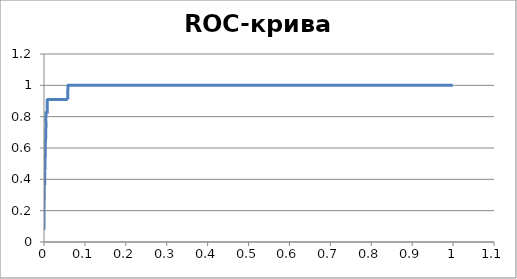
| Category | Чувствительность |
|---|---|
| 0.0 | 0.091 |
| 0.0 | 0.091 |
| 0.0 | 0.182 |
| 0.0003543586109142627 | 0.273 |
| 0.0003543586109142627 | 0.273 |
| 0.0003543586109142627 | 0.364 |
| 0.0007087172218285254 | 0.364 |
| 0.0007087172218285254 | 0.364 |
| 0.001063075832742788 | 0.364 |
| 0.0014174344436569397 | 0.364 |
| 0.0017717930545712024 | 0.364 |
| 0.002126151665485465 | 0.455 |
| 0.0024805102763997278 | 0.545 |
| 0.0024805102763997278 | 0.545 |
| 0.0024805102763997278 | 0.545 |
| 0.0028348688873139904 | 0.545 |
| 0.003189227498228253 | 0.636 |
| 0.003543586109142405 | 0.636 |
| 0.003543586109142405 | 0.636 |
| 0.0038979447200566675 | 0.636 |
| 0.00425230333097093 | 0.727 |
| 0.004606661941885193 | 0.727 |
| 0.004606661941885193 | 0.818 |
| 0.0049610205527994555 | 0.818 |
| 0.0049610205527994555 | 0.818 |
| 0.005315379163713718 | 0.818 |
| 0.00566973777462787 | 0.818 |
| 0.0060240963855421326 | 0.818 |
| 0.006378454996456395 | 0.818 |
| 0.006732813607370658 | 0.818 |
| 0.007087172218284921 | 0.818 |
| 0.007441530829199183 | 0.818 |
| 0.007795889440113446 | 0.818 |
| 0.008150248051027598 | 0.909 |
| 0.00850460666194186 | 0.909 |
| 0.00850460666194186 | 0.909 |
| 0.008858965272856123 | 0.909 |
| 0.009213323883770386 | 0.909 |
| 0.009567682494684648 | 0.909 |
| 0.009922041105598911 | 0.909 |
| 0.010276399716513063 | 0.909 |
| 0.010630758327427325 | 0.909 |
| 0.010985116938341588 | 0.909 |
| 0.01133947554925585 | 0.909 |
| 0.011693834160170113 | 0.909 |
| 0.012048192771084376 | 0.909 |
| 0.012402551381998528 | 0.909 |
| 0.01275690999291279 | 0.909 |
| 0.013111268603827053 | 0.909 |
| 0.013465627214741316 | 0.909 |
| 0.013819985825655579 | 0.909 |
| 0.014174344436569841 | 0.909 |
| 0.014528703047484104 | 0.909 |
| 0.014883061658398256 | 0.909 |
| 0.015237420269312518 | 0.909 |
| 0.015591778880226781 | 0.909 |
| 0.015946137491141044 | 0.909 |
| 0.016300496102055306 | 0.909 |
| 0.01665485471296957 | 0.909 |
| 0.01700921332388372 | 0.909 |
| 0.017363571934797983 | 0.909 |
| 0.017717930545712246 | 0.909 |
| 0.01807228915662651 | 0.909 |
| 0.01842664776754077 | 0.909 |
| 0.018781006378455034 | 0.909 |
| 0.019135364989369297 | 0.909 |
| 0.01948972360028345 | 0.909 |
| 0.01984408221119771 | 0.909 |
| 0.020198440822111974 | 0.909 |
| 0.020552799433026236 | 0.909 |
| 0.0209071580439405 | 0.909 |
| 0.021261516654854762 | 0.909 |
| 0.021615875265768913 | 0.909 |
| 0.021970233876683176 | 0.909 |
| 0.02232459248759744 | 0.909 |
| 0.0226789510985117 | 0.909 |
| 0.023033309709425964 | 0.909 |
| 0.023387668320340227 | 0.909 |
| 0.02374202693125438 | 0.909 |
| 0.02409638554216864 | 0.909 |
| 0.024450744153082904 | 0.909 |
| 0.024805102763997167 | 0.909 |
| 0.02515946137491143 | 0.909 |
| 0.025513819985825692 | 0.909 |
| 0.025868178596739955 | 0.909 |
| 0.026222537207654106 | 0.909 |
| 0.02657689581856837 | 0.909 |
| 0.02693125442948263 | 0.909 |
| 0.027285613040396894 | 0.909 |
| 0.027639971651311157 | 0.909 |
| 0.02799433026222542 | 0.909 |
| 0.02834868887313957 | 0.909 |
| 0.028703047484053834 | 0.909 |
| 0.029057406094968097 | 0.909 |
| 0.02941176470588236 | 0.909 |
| 0.029766123316796622 | 0.909 |
| 0.030120481927710885 | 0.909 |
| 0.030474840538625037 | 0.909 |
| 0.0308291991495393 | 0.909 |
| 0.031183557760453562 | 0.909 |
| 0.031537916371367825 | 0.909 |
| 0.03189227498228209 | 0.909 |
| 0.03224663359319635 | 0.909 |
| 0.03260099220411061 | 0.909 |
| 0.032955350815024764 | 0.909 |
| 0.03330970942593903 | 0.909 |
| 0.03366406803685329 | 0.909 |
| 0.03401842664776755 | 0.909 |
| 0.034372785258681815 | 0.909 |
| 0.03472714386959608 | 0.909 |
| 0.03508150248051023 | 0.909 |
| 0.03543586109142449 | 0.909 |
| 0.035790219702338755 | 0.909 |
| 0.03614457831325302 | 0.909 |
| 0.03649893692416728 | 0.909 |
| 0.03685329553508154 | 0.909 |
| 0.037207654145995694 | 0.909 |
| 0.03756201275690996 | 0.909 |
| 0.03791637136782422 | 0.909 |
| 0.03827072997873848 | 0.909 |
| 0.038625088589652745 | 0.909 |
| 0.03897944720056701 | 0.909 |
| 0.03933380581148127 | 0.909 |
| 0.03968816442239542 | 0.909 |
| 0.040042523033309685 | 0.909 |
| 0.04039688164422395 | 0.909 |
| 0.04075124025513821 | 0.909 |
| 0.04110559886605247 | 0.909 |
| 0.041459957476966736 | 0.909 |
| 0.04181431608788089 | 0.909 |
| 0.04216867469879515 | 0.909 |
| 0.04252303330970941 | 0.909 |
| 0.042877391920623675 | 0.909 |
| 0.04323175053153794 | 0.909 |
| 0.0435861091424522 | 0.909 |
| 0.04394046775336635 | 0.909 |
| 0.044294826364280615 | 0.909 |
| 0.04464918497519488 | 0.909 |
| 0.04500354358610914 | 0.909 |
| 0.0453579021970234 | 0.909 |
| 0.045712260807937666 | 0.909 |
| 0.04606661941885193 | 0.909 |
| 0.04642097802976608 | 0.909 |
| 0.04677533664068034 | 0.909 |
| 0.047129695251594605 | 0.909 |
| 0.04748405386250887 | 0.909 |
| 0.04783841247342313 | 0.909 |
| 0.048192771084337394 | 0.909 |
| 0.048547129695251545 | 0.909 |
| 0.04890148830616581 | 0.909 |
| 0.04925584691708007 | 0.909 |
| 0.04961020552799433 | 0.909 |
| 0.049964564138908596 | 0.909 |
| 0.05031892274982286 | 0.909 |
| 0.05067328136073712 | 0.909 |
| 0.05102763997165127 | 0.909 |
| 0.051381998582565536 | 0.909 |
| 0.0517363571934798 | 0.909 |
| 0.05209071580439406 | 0.909 |
| 0.052445074415308324 | 0.909 |
| 0.052799433026222586 | 0.909 |
| 0.05315379163713674 | 0.909 |
| 0.053508150248051 | 0.909 |
| 0.05386250885896526 | 0.909 |
| 0.054216867469879526 | 0.909 |
| 0.05457122608079379 | 0.909 |
| 0.05492558469170805 | 0.909 |
| 0.0552799433026222 | 0.909 |
| 0.055634301913536466 | 0.909 |
| 0.05598866052445073 | 0.909 |
| 0.05634301913536499 | 0.909 |
| 0.056697377746279254 | 0.909 |
| 0.05705173635719352 | 0.909 |
| 0.05740609496810778 | 0.909 |
| 0.05776045357902193 | 0.909 |
| 0.058114812189936194 | 0.909 |
| 0.058469170800850456 | 1 |
| 0.05882352941176472 | 1 |
| 0.05882352941176472 | 1 |
| 0.05917788802267898 | 1 |
| 0.059532246633593244 | 1 |
| 0.059886605244507396 | 1 |
| 0.06024096385542166 | 1 |
| 0.06059532246633592 | 1 |
| 0.060949681077250184 | 1 |
| 0.06130403968816445 | 1 |
| 0.06165839829907871 | 1 |
| 0.06201275690999286 | 1 |
| 0.062367115520907124 | 1 |
| 0.06272147413182139 | 1 |
| 0.06307583274273565 | 1 |
| 0.06343019135364991 | 1 |
| 0.06378454996456417 | 1 |
| 0.06413890857547844 | 1 |
| 0.06449326718639259 | 1 |
| 0.06484762579730685 | 1 |
| 0.06520198440822111 | 1 |
| 0.06555634301913538 | 1 |
| 0.06591070163004964 | 1 |
| 0.0662650602409639 | 1 |
| 0.06661941885187805 | 1 |
| 0.06697377746279232 | 1 |
| 0.06732813607370658 | 1 |
| 0.06768249468462084 | 1 |
| 0.0680368532955351 | 1 |
| 0.06839121190644937 | 1 |
| 0.06874557051736352 | 1 |
| 0.06909992912827778 | 1 |
| 0.06945428773919204 | 1 |
| 0.06980864635010631 | 1 |
| 0.07016300496102057 | 1 |
| 0.07051736357193483 | 1 |
| 0.0708717221828491 | 1 |
| 0.07122608079376325 | 1 |
| 0.07158043940467751 | 1 |
| 0.07193479801559177 | 1 |
| 0.07228915662650603 | 1 |
| 0.0726435152374203 | 1 |
| 0.07299787384833456 | 1 |
| 0.07335223245924871 | 1 |
| 0.07370659107016297 | 1 |
| 0.07406094968107724 | 1 |
| 0.0744153082919915 | 1 |
| 0.07476966690290576 | 1 |
| 0.07512402551382003 | 1 |
| 0.07547838412473418 | 1 |
| 0.07583274273564844 | 1 |
| 0.0761871013465627 | 1 |
| 0.07654145995747696 | 1 |
| 0.07689581856839123 | 1 |
| 0.07725017717930549 | 1 |
| 0.07760453579021975 | 1 |
| 0.0779588944011339 | 1 |
| 0.07831325301204817 | 1 |
| 0.07866761162296243 | 1 |
| 0.07902197023387669 | 1 |
| 0.07937632884479096 | 1 |
| 0.07973068745570522 | 1 |
| 0.08008504606661937 | 1 |
| 0.08043940467753363 | 1 |
| 0.0807937632884479 | 1 |
| 0.08114812189936216 | 1 |
| 0.08150248051027642 | 1 |
| 0.08185683912119068 | 1 |
| 0.08221119773210483 | 1 |
| 0.0825655563430191 | 1 |
| 0.08291991495393336 | 1 |
| 0.08327427356484762 | 1 |
| 0.08362863217576189 | 1 |
| 0.08398299078667615 | 1 |
| 0.08433734939759041 | 1 |
| 0.08469170800850456 | 1 |
| 0.08504606661941883 | 1 |
| 0.08540042523033309 | 1 |
| 0.08575478384124735 | 1 |
| 0.08610914245216161 | 1 |
| 0.08646350106307588 | 1 |
| 0.08681785967399003 | 1 |
| 0.08717221828490429 | 1 |
| 0.08752657689581855 | 1 |
| 0.08788093550673282 | 1 |
| 0.08823529411764708 | 1 |
| 0.08858965272856134 | 1 |
| 0.0889440113394756 | 1 |
| 0.08929836995038976 | 1 |
| 0.08965272856130402 | 1 |
| 0.09000708717221828 | 1 |
| 0.09036144578313254 | 1 |
| 0.0907158043940468 | 1 |
| 0.09107016300496107 | 1 |
| 0.09142452161587522 | 1 |
| 0.09177888022678948 | 1 |
| 0.09213323883770375 | 1 |
| 0.09248759744861801 | 1 |
| 0.09284195605953227 | 1 |
| 0.09319631467044653 | 1 |
| 0.09355067328136069 | 1 |
| 0.09390503189227495 | 1 |
| 0.09425939050318921 | 1 |
| 0.09461374911410347 | 1 |
| 0.09496810772501774 | 1 |
| 0.095322466335932 | 1 |
| 0.09567682494684626 | 1 |
| 0.09603118355776041 | 1 |
| 0.09638554216867468 | 1 |
| 0.09673990077958894 | 1 |
| 0.0970942593905032 | 1 |
| 0.09744861800141746 | 1 |
| 0.09780297661233173 | 1 |
| 0.09815733522324588 | 1 |
| 0.09851169383416014 | 1 |
| 0.0988660524450744 | 1 |
| 0.09922041105598867 | 1 |
| 0.09957476966690293 | 1 |
| 0.09992912827781719 | 1 |
| 0.10028348688873134 | 1 |
| 0.1006378454996456 | 1 |
| 0.10099220411055987 | 1 |
| 0.10134656272147413 | 1 |
| 0.1017009213323884 | 1 |
| 0.10205527994330266 | 1 |
| 0.10240963855421692 | 1 |
| 0.10276399716513107 | 1 |
| 0.10311835577604533 | 1 |
| 0.1034727143869596 | 1 |
| 0.10382707299787386 | 1 |
| 0.10418143160878812 | 1 |
| 0.10453579021970238 | 1 |
| 0.10489014883061654 | 1 |
| 0.1052445074415308 | 1 |
| 0.10559886605244506 | 1 |
| 0.10595322466335932 | 1 |
| 0.10630758327427359 | 1 |
| 0.10666194188518785 | 1 |
| 0.107016300496102 | 1 |
| 0.10737065910701626 | 1 |
| 0.10772501771793053 | 1 |
| 0.10807937632884479 | 1 |
| 0.10843373493975905 | 1 |
| 0.10878809355067331 | 1 |
| 0.10914245216158758 | 1 |
| 0.10949681077250173 | 1 |
| 0.10985116938341599 | 1 |
| 0.11020552799433025 | 1 |
| 0.11055988660524452 | 1 |
| 0.11091424521615878 | 1 |
| 0.11126860382707304 | 1 |
| 0.1116229624379872 | 1 |
| 0.11197732104890146 | 1 |
| 0.11233167965981572 | 1 |
| 0.11268603827072998 | 1 |
| 0.11304039688164425 | 1 |
| 0.11339475549255851 | 1 |
| 0.11374911410347266 | 1 |
| 0.11410347271438692 | 1 |
| 0.11445783132530118 | 1 |
| 0.11481218993621545 | 1 |
| 0.11516654854712971 | 1 |
| 0.11552090715804397 | 1 |
| 0.11587526576895824 | 1 |
| 0.11622962437987239 | 1 |
| 0.11658398299078665 | 1 |
| 0.11693834160170091 | 1 |
| 0.11729270021261518 | 1 |
| 0.11764705882352944 | 1 |
| 0.1180014174344437 | 1 |
| 0.11835577604535785 | 1 |
| 0.11871013465627211 | 1 |
| 0.11906449326718638 | 1 |
| 0.11941885187810064 | 1 |
| 0.1197732104890149 | 1 |
| 0.12012756909992917 | 1 |
| 0.12048192771084343 | 1 |
| 0.12083628632175758 | 1 |
| 0.12119064493267184 | 1 |
| 0.1215450035435861 | 1 |
| 0.12189936215450037 | 1 |
| 0.12225372076541463 | 1 |
| 0.1226080793763289 | 1 |
| 0.12296243798724305 | 1 |
| 0.12331679659815731 | 1 |
| 0.12367115520907157 | 1 |
| 0.12402551381998583 | 1 |
| 0.1243798724309001 | 1 |
| 0.12473423104181436 | 1 |
| 0.1250885896527285 | 1 |
| 0.12544294826364277 | 1 |
| 0.12579730687455704 | 1 |
| 0.1261516654854713 | 1 |
| 0.12650602409638556 | 1 |
| 0.12686038270729982 | 1 |
| 0.1272147413182141 | 1 |
| 0.12756909992912824 | 1 |
| 0.1279234585400425 | 1 |
| 0.12827781715095676 | 1 |
| 0.12863217576187103 | 1 |
| 0.1289865343727853 | 1 |
| 0.12934089298369955 | 1 |
| 0.1296952515946137 | 1 |
| 0.13004961020552797 | 1 |
| 0.13040396881644223 | 1 |
| 0.1307583274273565 | 1 |
| 0.13111268603827075 | 1 |
| 0.13146704464918502 | 1 |
| 0.13182140326009917 | 1 |
| 0.13217576187101343 | 1 |
| 0.1325301204819277 | 1 |
| 0.13288447909284196 | 1 |
| 0.13323883770375622 | 1 |
| 0.13359319631467048 | 1 |
| 0.13394755492558474 | 1 |
| 0.1343019135364989 | 1 |
| 0.13465627214741316 | 1 |
| 0.13501063075832742 | 1 |
| 0.13536498936924168 | 1 |
| 0.13571934798015595 | 1 |
| 0.1360737065910702 | 1 |
| 0.13642806520198436 | 1 |
| 0.13678242381289862 | 1 |
| 0.1371367824238129 | 1 |
| 0.13749114103472715 | 1 |
| 0.1378454996456414 | 1 |
| 0.13819985825655567 | 1 |
| 0.13855421686746983 | 1 |
| 0.1389085754783841 | 1 |
| 0.13926293408929835 | 1 |
| 0.13961729270021261 | 1 |
| 0.13997165131112688 | 1 |
| 0.14032600992204114 | 1 |
| 0.1406803685329554 | 1 |
| 0.14103472714386955 | 1 |
| 0.14138908575478382 | 1 |
| 0.14174344436569808 | 1 |
| 0.14209780297661234 | 1 |
| 0.1424521615875266 | 1 |
| 0.14280652019844087 | 1 |
| 0.14316087880935502 | 1 |
| 0.14351523742026928 | 1 |
| 0.14386959603118354 | 1 |
| 0.1442239546420978 | 1 |
| 0.14457831325301207 | 1 |
| 0.14493267186392633 | 1 |
| 0.14528703047484048 | 1 |
| 0.14564138908575475 | 1 |
| 0.145995747696669 | 1 |
| 0.14635010630758327 | 1 |
| 0.14670446491849753 | 1 |
| 0.1470588235294118 | 1 |
| 0.14741318214032606 | 1 |
| 0.1477675407512402 | 1 |
| 0.14812189936215447 | 1 |
| 0.14847625797306874 | 1 |
| 0.148830616583983 | 1 |
| 0.14918497519489726 | 1 |
| 0.14953933380581153 | 1 |
| 0.14989369241672568 | 1 |
| 0.15024805102763994 | 1 |
| 0.1506024096385542 | 1 |
| 0.15095676824946846 | 1 |
| 0.15131112686038273 | 1 |
| 0.151665485471297 | 1 |
| 0.15201984408221125 | 1 |
| 0.1523742026931254 | 1 |
| 0.15272856130403967 | 1 |
| 0.15308291991495393 | 1 |
| 0.1534372785258682 | 1 |
| 0.15379163713678246 | 1 |
| 0.15414599574769672 | 1 |
| 0.15450035435861087 | 1 |
| 0.15485471296952513 | 1 |
| 0.1552090715804394 | 1 |
| 0.15556343019135366 | 1 |
| 0.15591778880226792 | 1 |
| 0.15627214741318218 | 1 |
| 0.15662650602409633 | 1 |
| 0.1569808646350106 | 1 |
| 0.15733522324592486 | 1 |
| 0.15768958185683912 | 1 |
| 0.15804394046775339 | 1 |
| 0.15839829907866765 | 1 |
| 0.1587526576895819 | 1 |
| 0.15910701630049606 | 1 |
| 0.15946137491141033 | 1 |
| 0.1598157335223246 | 1 |
| 0.16017009213323885 | 1 |
| 0.1605244507441531 | 1 |
| 0.16087880935506738 | 1 |
| 0.16123316796598153 | 1 |
| 0.1615875265768958 | 1 |
| 0.16194188518781005 | 1 |
| 0.16229624379872432 | 1 |
| 0.16265060240963858 | 1 |
| 0.16300496102055284 | 1 |
| 0.163359319631467 | 1 |
| 0.16371367824238126 | 1 |
| 0.16406803685329552 | 1 |
| 0.16442239546420978 | 1 |
| 0.16477675407512404 | 1 |
| 0.1651311126860383 | 1 |
| 0.16548547129695257 | 1 |
| 0.16583982990786672 | 1 |
| 0.16619418851878098 | 1 |
| 0.16654854712969525 | 1 |
| 0.1669029057406095 | 1 |
| 0.16725726435152377 | 1 |
| 0.16761162296243803 | 1 |
| 0.16796598157335219 | 1 |
| 0.16832034018426645 | 1 |
| 0.1686746987951807 | 1 |
| 0.16902905740609497 | 1 |
| 0.16938341601700924 | 1 |
| 0.1697377746279235 | 1 |
| 0.17009213323883765 | 1 |
| 0.1704464918497519 | 1 |
| 0.17080085046066618 | 1 |
| 0.17115520907158044 | 1 |
| 0.1715095676824947 | 1 |
| 0.17186392629340896 | 1 |
| 0.17221828490432323 | 1 |
| 0.17257264351523738 | 1 |
| 0.17292700212615164 | 1 |
| 0.1732813607370659 | 1 |
| 0.17363571934798017 | 1 |
| 0.17399007795889443 | 1 |
| 0.1743444365698087 | 1 |
| 0.17469879518072284 | 1 |
| 0.1750531537916371 | 1 |
| 0.17540751240255137 | 1 |
| 0.17576187101346563 | 1 |
| 0.1761162296243799 | 1 |
| 0.17647058823529416 | 1 |
| 0.1768249468462083 | 1 |
| 0.17717930545712257 | 1 |
| 0.17753366406803683 | 1 |
| 0.1778880226789511 | 1 |
| 0.17824238128986536 | 1 |
| 0.17859673990077962 | 1 |
| 0.17895109851169388 | 1 |
| 0.17930545712260804 | 1 |
| 0.1796598157335223 | 1 |
| 0.18001417434443656 | 1 |
| 0.18036853295535082 | 1 |
| 0.1807228915662651 | 1 |
| 0.18107725017717935 | 1 |
| 0.1814316087880935 | 1 |
| 0.18178596739900776 | 1 |
| 0.18214032600992203 | 1 |
| 0.1824946846208363 | 1 |
| 0.18284904323175055 | 1 |
| 0.18320340184266481 | 1 |
| 0.18355776045357908 | 1 |
| 0.18391211906449323 | 1 |
| 0.1842664776754075 | 1 |
| 0.18462083628632175 | 1 |
| 0.18497519489723602 | 1 |
| 0.18532955350815028 | 1 |
| 0.18568391211906454 | 1 |
| 0.1860382707299787 | 1 |
| 0.18639262934089296 | 1 |
| 0.18674698795180722 | 1 |
| 0.18710134656272148 | 1 |
| 0.18745570517363574 | 1 |
| 0.18781006378455 | 1 |
| 0.18816442239546416 | 1 |
| 0.18851878100637842 | 1 |
| 0.18887313961729268 | 1 |
| 0.18922749822820695 | 1 |
| 0.1895818568391212 | 1 |
| 0.18993621545003547 | 1 |
| 0.19029057406094974 | 1 |
| 0.1906449326718639 | 1 |
| 0.19099929128277815 | 1 |
| 0.1913536498936924 | 1 |
| 0.19170800850460668 | 1 |
| 0.19206236711552094 | 1 |
| 0.1924167257264352 | 1 |
| 0.19277108433734935 | 1 |
| 0.19312544294826361 | 1 |
| 0.19347980155917788 | 1 |
| 0.19383416017009214 | 1 |
| 0.1941885187810064 | 1 |
| 0.19454287739192067 | 1 |
| 0.19489723600283482 | 1 |
| 0.19525159461374908 | 1 |
| 0.19560595322466334 | 1 |
| 0.1959603118355776 | 1 |
| 0.19631467044649187 | 1 |
| 0.19666902905740613 | 1 |
| 0.1970233876683204 | 1 |
| 0.19737774627923454 | 1 |
| 0.1977321048901488 | 1 |
| 0.19808646350106307 | 1 |
| 0.19844082211197733 | 1 |
| 0.1987951807228916 | 1 |
| 0.19914953933380586 | 1 |
| 0.19950389794472 | 1 |
| 0.19985825655563427 | 1 |
| 0.20021261516654854 | 1 |
| 0.2005669737774628 | 1 |
| 0.20092133238837706 | 1 |
| 0.20127569099929132 | 1 |
| 0.20163004961020548 | 1 |
| 0.20198440822111974 | 1 |
| 0.202338766832034 | 1 |
| 0.20269312544294826 | 1 |
| 0.20304748405386253 | 1 |
| 0.2034018426647768 | 1 |
| 0.20375620127569105 | 1 |
| 0.2041105598866052 | 1 |
| 0.20446491849751947 | 1 |
| 0.20481927710843373 | 1 |
| 0.205173635719348 | 1 |
| 0.20552799433026225 | 1 |
| 0.20588235294117652 | 1 |
| 0.20623671155209067 | 1 |
| 0.20659107016300493 | 1 |
| 0.2069454287739192 | 1 |
| 0.20729978738483346 | 1 |
| 0.20765414599574772 | 1 |
| 0.20800850460666198 | 1 |
| 0.20836286321757613 | 1 |
| 0.2087172218284904 | 1 |
| 0.20907158043940466 | 1 |
| 0.20942593905031892 | 1 |
| 0.20978029766123318 | 1 |
| 0.21013465627214745 | 1 |
| 0.2104890148830617 | 1 |
| 0.21084337349397586 | 1 |
| 0.21119773210489012 | 1 |
| 0.2115520907158044 | 1 |
| 0.21190644932671865 | 1 |
| 0.2122608079376329 | 1 |
| 0.21261516654854717 | 1 |
| 0.21296952515946133 | 1 |
| 0.2133238837703756 | 1 |
| 0.21367824238128985 | 1 |
| 0.21403260099220411 | 1 |
| 0.21438695960311838 | 1 |
| 0.21474131821403264 | 1 |
| 0.2150956768249468 | 1 |
| 0.21545003543586105 | 1 |
| 0.21580439404677532 | 1 |
| 0.21615875265768958 | 1 |
| 0.21651311126860384 | 1 |
| 0.2168674698795181 | 1 |
| 0.21722182849043237 | 1 |
| 0.21757618710134652 | 1 |
| 0.21793054571226078 | 1 |
| 0.21828490432317504 | 1 |
| 0.2186392629340893 | 1 |
| 0.21899362154500357 | 1 |
| 0.21934798015591783 | 1 |
| 0.21970233876683198 | 1 |
| 0.22005669737774625 | 1 |
| 0.2204110559886605 | 1 |
| 0.22076541459957477 | 1 |
| 0.22111977321048903 | 1 |
| 0.2214741318214033 | 1 |
| 0.22182849043231756 | 1 |
| 0.2221828490432317 | 1 |
| 0.22253720765414597 | 1 |
| 0.22289156626506024 | 1 |
| 0.2232459248759745 | 1 |
| 0.22360028348688876 | 1 |
| 0.22395464209780303 | 1 |
| 0.22430900070871718 | 1 |
| 0.22466335931963144 | 1 |
| 0.2250177179305457 | 1 |
| 0.22537207654145996 | 1 |
| 0.22572643515237423 | 1 |
| 0.2260807937632885 | 1 |
| 0.22643515237420264 | 1 |
| 0.2267895109851169 | 1 |
| 0.22714386959603117 | 1 |
| 0.22749822820694543 | 1 |
| 0.2278525868178597 | 1 |
| 0.22820694542877396 | 1 |
| 0.22856130403968822 | 1 |
| 0.22891566265060237 | 1 |
| 0.22927002126151663 | 1 |
| 0.2296243798724309 | 1 |
| 0.22997873848334516 | 1 |
| 0.23033309709425942 | 1 |
| 0.23068745570517368 | 1 |
| 0.23104181431608783 | 1 |
| 0.2313961729270021 | 1 |
| 0.23175053153791636 | 1 |
| 0.23210489014883062 | 1 |
| 0.23245924875974489 | 1 |
| 0.23281360737065915 | 1 |
| 0.2331679659815733 | 1 |
| 0.23352232459248756 | 1 |
| 0.23387668320340183 | 1 |
| 0.2342310418143161 | 1 |
| 0.23458540042523035 | 1 |
| 0.2349397590361446 | 1 |
| 0.23529411764705888 | 1 |
| 0.23564847625797303 | 1 |
| 0.2360028348688873 | 1 |
| 0.23635719347980155 | 1 |
| 0.23671155209071582 | 1 |
| 0.23706591070163008 | 1 |
| 0.23742026931254434 | 1 |
| 0.2377746279234585 | 1 |
| 0.23812898653437276 | 1 |
| 0.23848334514528702 | 1 |
| 0.23883770375620128 | 1 |
| 0.23919206236711554 | 1 |
| 0.2395464209780298 | 1 |
| 0.23990077958894396 | 1 |
| 0.24025513819985822 | 1 |
| 0.24060949681077248 | 1 |
| 0.24096385542168675 | 1 |
| 0.241318214032601 | 1 |
| 0.24167257264351527 | 1 |
| 0.24202693125442953 | 1 |
| 0.24238128986534369 | 1 |
| 0.24273564847625795 | 1 |
| 0.2430900070871722 | 1 |
| 0.24344436569808647 | 1 |
| 0.24379872430900074 | 1 |
| 0.244153082919915 | 1 |
| 0.24450744153082915 | 1 |
| 0.2448618001417434 | 1 |
| 0.24521615875265768 | 1 |
| 0.24557051736357194 | 1 |
| 0.2459248759744862 | 1 |
| 0.24627923458540046 | 1 |
| 0.24663359319631462 | 1 |
| 0.24698795180722888 | 1 |
| 0.24734231041814314 | 1 |
| 0.2476966690290574 | 1 |
| 0.24805102763997167 | 1 |
| 0.24840538625088593 | 1 |
| 0.2487597448618002 | 1 |
| 0.24911410347271434 | 1 |
| 0.2494684620836286 | 1 |
| 0.24982282069454287 | 1 |
| 0.25017717930545713 | 1 |
| 0.2505315379163714 | 1 |
| 0.25088589652728566 | 1 |
| 0.2512402551381998 | 1 |
| 0.25159461374911407 | 1 |
| 0.25194897236002833 | 1 |
| 0.2523033309709426 | 1 |
| 0.25265768958185686 | 1 |
| 0.2530120481927711 | 1 |
| 0.2533664068036854 | 1 |
| 0.25372076541459954 | 1 |
| 0.2540751240255138 | 1 |
| 0.25442948263642806 | 1 |
| 0.2547838412473423 | 1 |
| 0.2551381998582566 | 1 |
| 0.25549255846917085 | 1 |
| 0.255846917080085 | 1 |
| 0.25620127569099926 | 1 |
| 0.2565556343019135 | 1 |
| 0.2569099929128278 | 1 |
| 0.25726435152374205 | 1 |
| 0.2576187101346563 | 1 |
| 0.25797306874557047 | 1 |
| 0.25832742735648473 | 1 |
| 0.258681785967399 | 1 |
| 0.25903614457831325 | 1 |
| 0.2593905031892275 | 1 |
| 0.2597448618001418 | 1 |
| 0.26009922041105604 | 1 |
| 0.2604535790219702 | 1 |
| 0.26080793763288446 | 1 |
| 0.2611622962437987 | 1 |
| 0.261516654854713 | 1 |
| 0.26187101346562724 | 1 |
| 0.2622253720765415 | 1 |
| 0.26257973068745566 | 1 |
| 0.2629340892983699 | 1 |
| 0.2632884479092842 | 1 |
| 0.26364280652019845 | 1 |
| 0.2639971651311127 | 1 |
| 0.264351523742027 | 1 |
| 0.2647058823529411 | 1 |
| 0.2650602409638554 | 1 |
| 0.26541459957476965 | 1 |
| 0.2657689581856839 | 1 |
| 0.2661233167965982 | 1 |
| 0.26647767540751244 | 1 |
| 0.2668320340184267 | 1 |
| 0.26718639262934085 | 1 |
| 0.2675407512402551 | 1 |
| 0.2678951098511694 | 1 |
| 0.26824946846208364 | 1 |
| 0.2686038270729979 | 1 |
| 0.26895818568391217 | 1 |
| 0.2693125442948263 | 1 |
| 0.2696669029057406 | 1 |
| 0.27002126151665484 | 1 |
| 0.2703756201275691 | 1 |
| 0.27072997873848337 | 1 |
| 0.27108433734939763 | 1 |
| 0.2714386959603118 | 1 |
| 0.27179305457122604 | 1 |
| 0.2721474131821403 | 1 |
| 0.27250177179305457 | 1 |
| 0.27285613040396883 | 1 |
| 0.2732104890148831 | 1 |
| 0.27356484762579736 | 1 |
| 0.2739192062367115 | 1 |
| 0.2742735648476258 | 1 |
| 0.27462792345854004 | 1 |
| 0.2749822820694543 | 1 |
| 0.27533664068036856 | 1 |
| 0.2756909992912828 | 1 |
| 0.276045357902197 | 1 |
| 0.27639971651311124 | 1 |
| 0.2767540751240255 | 1 |
| 0.27710843373493976 | 1 |
| 0.277462792345854 | 1 |
| 0.2778171509567683 | 1 |
| 0.27817150956768244 | 1 |
| 0.2785258681785967 | 1 |
| 0.27888022678951097 | 1 |
| 0.27923458540042523 | 1 |
| 0.2795889440113395 | 1 |
| 0.27994330262225375 | 1 |
| 0.280297661233168 | 1 |
| 0.28065201984408217 | 1 |
| 0.28100637845499643 | 1 |
| 0.2813607370659107 | 1 |
| 0.28171509567682496 | 1 |
| 0.2820694542877392 | 1 |
| 0.2824238128986535 | 1 |
| 0.28277817150956763 | 1 |
| 0.2831325301204819 | 1 |
| 0.28348688873139616 | 1 |
| 0.2838412473423104 | 1 |
| 0.2841956059532247 | 1 |
| 0.28454996456413895 | 1 |
| 0.2849043231750532 | 1 |
| 0.28525868178596736 | 1 |
| 0.2856130403968816 | 1 |
| 0.2859673990077959 | 1 |
| 0.28632175761871015 | 1 |
| 0.2866761162296244 | 1 |
| 0.2870304748405387 | 1 |
| 0.2873848334514528 | 1 |
| 0.2877391920623671 | 1 |
| 0.28809355067328135 | 1 |
| 0.2884479092841956 | 1 |
| 0.2888022678951099 | 1 |
| 0.28915662650602414 | 1 |
| 0.2895109851169383 | 1 |
| 0.28986534372785255 | 1 |
| 0.2902197023387668 | 1 |
| 0.2905740609496811 | 1 |
| 0.29092841956059534 | 1 |
| 0.2912827781715096 | 1 |
| 0.29163713678242387 | 1 |
| 0.291991495393338 | 1 |
| 0.2923458540042523 | 1 |
| 0.29270021261516654 | 1 |
| 0.2930545712260808 | 1 |
| 0.29340892983699507 | 1 |
| 0.29376328844790933 | 1 |
| 0.2941176470588235 | 1 |
| 0.29447200566973775 | 1 |
| 0.294826364280652 | 1 |
| 0.29518072289156627 | 1 |
| 0.29553508150248053 | 1 |
| 0.2958894401133948 | 1 |
| 0.29624379872430895 | 1 |
| 0.2965981573352232 | 1 |
| 0.2969525159461375 | 1 |
| 0.29730687455705174 | 1 |
| 0.297661233167966 | 1 |
| 0.29801559177888026 | 1 |
| 0.2983699503897945 | 1 |
| 0.2987243090007087 | 1 |
| 0.29907866761162294 | 1 |
| 0.2994330262225372 | 1 |
| 0.29978738483345146 | 1 |
| 0.3001417434443657 | 1 |
| 0.30049610205528 | 1 |
| 0.30085046066619414 | 1 |
| 0.3012048192771084 | 1 |
| 0.30155917788802267 | 1 |
| 0.30191353649893693 | 1 |
| 0.3022678951098512 | 1 |
| 0.30262225372076546 | 1 |
| 0.3029766123316796 | 1 |
| 0.30333097094259387 | 1 |
| 0.30368532955350813 | 1 |
| 0.3040396881644224 | 1 |
| 0.30439404677533666 | 1 |
| 0.3047484053862509 | 1 |
| 0.3051027639971652 | 1 |
| 0.30545712260807933 | 1 |
| 0.3058114812189936 | 1 |
| 0.30616583982990786 | 1 |
| 0.3065201984408221 | 1 |
| 0.3068745570517364 | 1 |
| 0.30722891566265065 | 1 |
| 0.3075832742735648 | 1 |
| 0.30793763288447906 | 1 |
| 0.3082919914953933 | 1 |
| 0.3086463501063076 | 1 |
| 0.30900070871722185 | 1 |
| 0.3093550673281361 | 1 |
| 0.30970942593905026 | 1 |
| 0.3100637845499645 | 1 |
| 0.3104181431608788 | 1 |
| 0.31077250177179305 | 1 |
| 0.3111268603827073 | 1 |
| 0.3114812189936216 | 1 |
| 0.31183557760453584 | 1 |
| 0.31218993621545 | 1 |
| 0.31254429482636426 | 1 |
| 0.3128986534372785 | 1 |
| 0.3132530120481928 | 1 |
| 0.31360737065910704 | 1 |
| 0.3139617292700213 | 1 |
| 0.31431608788093546 | 1 |
| 0.3146704464918497 | 1 |
| 0.315024805102764 | 1 |
| 0.31537916371367825 | 1 |
| 0.3157335223245925 | 1 |
| 0.31608788093550677 | 1 |
| 0.3164422395464209 | 1 |
| 0.3167965981573352 | 1 |
| 0.31715095676824945 | 1 |
| 0.3175053153791637 | 1 |
| 0.317859673990078 | 1 |
| 0.31821403260099224 | 1 |
| 0.3185683912119065 | 1 |
| 0.31892274982282065 | 1 |
| 0.3192771084337349 | 1 |
| 0.3196314670446492 | 1 |
| 0.31998582565556344 | 1 |
| 0.3203401842664777 | 1 |
| 0.32069454287739196 | 1 |
| 0.3210489014883061 | 1 |
| 0.3214032600992204 | 1 |
| 0.32175761871013464 | 1 |
| 0.3221119773210489 | 1 |
| 0.32246633593196317 | 1 |
| 0.32282069454287743 | 1 |
| 0.3231750531537917 | 1 |
| 0.32352941176470584 | 1 |
| 0.3238837703756201 | 1 |
| 0.32423812898653437 | 1 |
| 0.32459248759744863 | 1 |
| 0.3249468462083629 | 1 |
| 0.32530120481927716 | 1 |
| 0.3256555634301913 | 1 |
| 0.32600992204110557 | 1 |
| 0.32636428065201983 | 1 |
| 0.3267186392629341 | 1 |
| 0.32707299787384836 | 1 |
| 0.3274273564847626 | 1 |
| 0.3277817150956768 | 1 |
| 0.32813607370659104 | 1 |
| 0.3284904323175053 | 1 |
| 0.32884479092841956 | 1 |
| 0.3291991495393338 | 1 |
| 0.3295535081502481 | 1 |
| 0.32990786676116235 | 1 |
| 0.3302622253720765 | 1 |
| 0.33061658398299076 | 1 |
| 0.330970942593905 | 1 |
| 0.3313253012048193 | 1 |
| 0.33167965981573355 | 1 |
| 0.3320340184266478 | 1 |
| 0.33238837703756197 | 1 |
| 0.33274273564847623 | 1 |
| 0.3330970942593905 | 1 |
| 0.33345145287030475 | 1 |
| 0.333805811481219 | 1 |
| 0.3341601700921333 | 1 |
| 0.33451452870304743 | 1 |
| 0.3348688873139617 | 1 |
| 0.33522324592487596 | 1 |
| 0.3355776045357902 | 1 |
| 0.3359319631467045 | 1 |
| 0.33628632175761874 | 1 |
| 0.336640680368533 | 1 |
| 0.33699503897944716 | 1 |
| 0.3373493975903614 | 1 |
| 0.3377037562012757 | 1 |
| 0.33805811481218995 | 1 |
| 0.3384124734231042 | 1 |
| 0.3387668320340185 | 1 |
| 0.3391211906449326 | 1 |
| 0.3394755492558469 | 1 |
| 0.33982990786676115 | 1 |
| 0.3401842664776754 | 1 |
| 0.3405386250885897 | 1 |
| 0.34089298369950394 | 1 |
| 0.3412473423104181 | 1 |
| 0.34160170092133235 | 1 |
| 0.3419560595322466 | 1 |
| 0.3423104181431609 | 1 |
| 0.34266477675407514 | 1 |
| 0.3430191353649894 | 1 |
| 0.34337349397590367 | 1 |
| 0.3437278525868178 | 1 |
| 0.3440822111977321 | 1 |
| 0.34443656980864634 | 1 |
| 0.3447909284195606 | 1 |
| 0.34514528703047487 | 1 |
| 0.34549964564138913 | 1 |
| 0.3458540042523033 | 1 |
| 0.34620836286321754 | 1 |
| 0.3465627214741318 | 1 |
| 0.34691708008504607 | 1 |
| 0.34727143869596033 | 1 |
| 0.3476257973068746 | 1 |
| 0.34798015591778875 | 1 |
| 0.348334514528703 | 1 |
| 0.3486888731396173 | 1 |
| 0.34904323175053154 | 1 |
| 0.3493975903614458 | 1 |
| 0.34975194897236006 | 1 |
| 0.3501063075832743 | 1 |
| 0.3504606661941885 | 1 |
| 0.35081502480510274 | 1 |
| 0.351169383416017 | 1 |
| 0.35152374202693126 | 1 |
| 0.3518781006378455 | 1 |
| 0.3522324592487598 | 1 |
| 0.35258681785967394 | 1 |
| 0.3529411764705882 | 1 |
| 0.35329553508150247 | 1 |
| 0.35364989369241673 | 1 |
| 0.354004252303331 | 1 |
| 0.35435861091424525 | 1 |
| 0.3547129695251595 | 1 |
| 0.35506732813607367 | 1 |
| 0.35542168674698793 | 1 |
| 0.3557760453579022 | 1 |
| 0.35613040396881646 | 1 |
| 0.3564847625797307 | 1 |
| 0.356839121190645 | 1 |
| 0.35719347980155913 | 1 |
| 0.3575478384124734 | 1 |
| 0.35790219702338766 | 1 |
| 0.3582565556343019 | 1 |
| 0.3586109142452162 | 1 |
| 0.35896527285613045 | 1 |
| 0.3593196314670446 | 1 |
| 0.35967399007795886 | 1 |
| 0.3600283486888731 | 1 |
| 0.3603827072997874 | 1 |
| 0.36073706591070165 | 1 |
| 0.3610914245216159 | 1 |
| 0.3614457831325302 | 1 |
| 0.3618001417434443 | 1 |
| 0.3621545003543586 | 1 |
| 0.36250885896527285 | 1 |
| 0.3628632175761871 | 1 |
| 0.3632175761871014 | 1 |
| 0.36357193479801564 | 1 |
| 0.3639262934089298 | 1 |
| 0.36428065201984405 | 1 |
| 0.3646350106307583 | 1 |
| 0.3649893692416726 | 1 |
| 0.36534372785258684 | 1 |
| 0.3656980864635011 | 1 |
| 0.36605244507441526 | 1 |
| 0.3664068036853295 | 1 |
| 0.3667611622962438 | 1 |
| 0.36711552090715804 | 1 |
| 0.3674698795180723 | 1 |
| 0.36782423812898657 | 1 |
| 0.36817859673990083 | 1 |
| 0.368532955350815 | 1 |
| 0.36888731396172925 | 1 |
| 0.3692416725726435 | 1 |
| 0.36959603118355777 | 1 |
| 0.36995038979447203 | 1 |
| 0.3703047484053863 | 1 |
| 0.37065910701630045 | 1 |
| 0.3710134656272147 | 1 |
| 0.371367824238129 | 1 |
| 0.37172218284904324 | 1 |
| 0.3720765414599575 | 1 |
| 0.37243090007087176 | 1 |
| 0.3727852586817859 | 1 |
| 0.3731396172927002 | 1 |
| 0.37349397590361444 | 1 |
| 0.3738483345145287 | 1 |
| 0.37420269312544296 | 1 |
| 0.3745570517363572 | 1 |
| 0.3749114103472715 | 1 |
| 0.37526576895818564 | 1 |
| 0.3756201275690999 | 1 |
| 0.37597448618001417 | 1 |
| 0.37632884479092843 | 1 |
| 0.3766832034018427 | 1 |
| 0.37703756201275695 | 1 |
| 0.3773919206236711 | 1 |
| 0.37774627923458537 | 1 |
| 0.37810063784549963 | 1 |
| 0.3784549964564139 | 1 |
| 0.37880935506732816 | 1 |
| 0.3791637136782424 | 1 |
| 0.37951807228915657 | 1 |
| 0.37987243090007083 | 1 |
| 0.3802267895109851 | 1 |
| 0.38058114812189936 | 1 |
| 0.3809355067328136 | 1 |
| 0.3812898653437279 | 1 |
| 0.38164422395464215 | 1 |
| 0.3819985825655563 | 1 |
| 0.38235294117647056 | 1 |
| 0.3827072997873848 | 1 |
| 0.3830616583982991 | 1 |
| 0.38341601700921335 | 1 |
| 0.3837703756201276 | 1 |
| 0.38412473423104176 | 1 |
| 0.384479092841956 | 1 |
| 0.3848334514528703 | 1 |
| 0.38518781006378455 | 1 |
| 0.3855421686746988 | 1 |
| 0.3858965272856131 | 1 |
| 0.38625088589652734 | 1 |
| 0.3866052445074415 | 1 |
| 0.38695960311835575 | 1 |
| 0.38731396172927 | 1 |
| 0.3876683203401843 | 1 |
| 0.38802267895109854 | 1 |
| 0.3883770375620128 | 1 |
| 0.38873139617292696 | 1 |
| 0.3890857547838412 | 1 |
| 0.3894401133947555 | 1 |
| 0.38979447200566975 | 1 |
| 0.390148830616584 | 1 |
| 0.39050318922749827 | 1 |
| 0.3908575478384124 | 1 |
| 0.3912119064493267 | 1 |
| 0.39156626506024095 | 1 |
| 0.3919206236711552 | 1 |
| 0.3922749822820695 | 1 |
| 0.39262934089298374 | 1 |
| 0.392983699503898 | 1 |
| 0.39333805811481215 | 1 |
| 0.3936924167257264 | 1 |
| 0.3940467753366407 | 1 |
| 0.39440113394755494 | 1 |
| 0.3947554925584692 | 1 |
| 0.39510985116938346 | 1 |
| 0.3954642097802976 | 1 |
| 0.3958185683912119 | 1 |
| 0.39617292700212614 | 1 |
| 0.3965272856130404 | 1 |
| 0.39688164422395467 | 1 |
| 0.39723600283486893 | 1 |
| 0.3975903614457831 | 1 |
| 0.39794472005669734 | 1 |
| 0.3982990786676116 | 1 |
| 0.39865343727852587 | 1 |
| 0.39900779588944013 | 1 |
| 0.3993621545003544 | 1 |
| 0.39971651311126866 | 1 |
| 0.4000708717221828 | 1 |
| 0.40042523033309707 | 1 |
| 0.40077958894401133 | 1 |
| 0.4011339475549256 | 1 |
| 0.40148830616583986 | 1 |
| 0.4018426647767541 | 1 |
| 0.4021970233876683 | 1 |
| 0.40255138199858254 | 1 |
| 0.4029057406094968 | 1 |
| 0.40326009922041106 | 1 |
| 0.4036144578313253 | 1 |
| 0.4039688164422396 | 1 |
| 0.40432317505315374 | 1 |
| 0.404677533664068 | 1 |
| 0.40503189227498226 | 1 |
| 0.4053862508858965 | 1 |
| 0.4057406094968108 | 1 |
| 0.40609496810772505 | 1 |
| 0.4064493267186393 | 1 |
| 0.40680368532955347 | 1 |
| 0.40715804394046773 | 1 |
| 0.407512402551382 | 1 |
| 0.40786676116229625 | 1 |
| 0.4082211197732105 | 1 |
| 0.4085754783841248 | 1 |
| 0.40892983699503893 | 1 |
| 0.4092841956059532 | 1 |
| 0.40963855421686746 | 1 |
| 0.4099929128277817 | 1 |
| 0.410347271438696 | 1 |
| 0.41070163004961024 | 1 |
| 0.4110559886605244 | 1 |
| 0.41141034727143866 | 1 |
| 0.4117647058823529 | 1 |
| 0.4121190644932672 | 1 |
| 0.41247342310418145 | 1 |
| 0.4128277817150957 | 1 |
| 0.41318214032601 | 1 |
| 0.4135364989369241 | 1 |
| 0.4138908575478384 | 1 |
| 0.41424521615875265 | 1 |
| 0.4145995747696669 | 1 |
| 0.4149539333805812 | 1 |
| 0.41530829199149544 | 1 |
| 0.4156626506024096 | 1 |
| 0.41601700921332385 | 1 |
| 0.4163713678242381 | 1 |
| 0.4167257264351524 | 1 |
| 0.41708008504606664 | 1 |
| 0.4174344436569809 | 1 |
| 0.41778880226789517 | 1 |
| 0.4181431608788093 | 1 |
| 0.4184975194897236 | 1 |
| 0.41885187810063784 | 1 |
| 0.4192062367115521 | 1 |
| 0.41956059532246637 | 1 |
| 0.41991495393338063 | 1 |
| 0.4202693125442948 | 1 |
| 0.42062367115520904 | 1 |
| 0.4209780297661233 | 1 |
| 0.42133238837703757 | 1 |
| 0.42168674698795183 | 1 |
| 0.4220411055988661 | 1 |
| 0.42239546420978025 | 1 |
| 0.4227498228206945 | 1 |
| 0.4231041814316088 | 1 |
| 0.42345854004252304 | 1 |
| 0.4238128986534373 | 1 |
| 0.42416725726435156 | 1 |
| 0.4245216158752658 | 1 |
| 0.42487597448618 | 1 |
| 0.42523033309709424 | 1 |
| 0.4255846917080085 | 1 |
| 0.42593905031892276 | 1 |
| 0.426293408929837 | 1 |
| 0.4266477675407513 | 1 |
| 0.42700212615166544 | 1 |
| 0.4273564847625797 | 1 |
| 0.42771084337349397 | 1 |
| 0.42806520198440823 | 1 |
| 0.4284195605953225 | 1 |
| 0.42877391920623675 | 1 |
| 0.4291282778171509 | 1 |
| 0.42948263642806517 | 1 |
| 0.42983699503897943 | 1 |
| 0.4301913536498937 | 1 |
| 0.43054571226080796 | 1 |
| 0.4309000708717222 | 1 |
| 0.4312544294826365 | 1 |
| 0.43160878809355063 | 1 |
| 0.4319631467044649 | 1 |
| 0.43231750531537916 | 1 |
| 0.4326718639262934 | 1 |
| 0.4330262225372077 | 1 |
| 0.43338058114812195 | 1 |
| 0.4337349397590361 | 1 |
| 0.43408929836995036 | 1 |
| 0.4344436569808646 | 1 |
| 0.4347980155917789 | 1 |
| 0.43515237420269315 | 1 |
| 0.4355067328136074 | 1 |
| 0.43586109142452156 | 1 |
| 0.4362154500354358 | 1 |
| 0.4365698086463501 | 1 |
| 0.43692416725726435 | 1 |
| 0.4372785258681786 | 1 |
| 0.4376328844790929 | 1 |
| 0.43798724309000714 | 1 |
| 0.4383416017009213 | 1 |
| 0.43869596031183555 | 1 |
| 0.4390503189227498 | 1 |
| 0.4394046775336641 | 1 |
| 0.43975903614457834 | 1 |
| 0.4401133947554926 | 1 |
| 0.44046775336640676 | 1 |
| 0.440822111977321 | 1 |
| 0.4411764705882353 | 1 |
| 0.44153082919914954 | 1 |
| 0.4418851878100638 | 1 |
| 0.44223954642097807 | 1 |
| 0.4425939050318922 | 1 |
| 0.4429482636428065 | 1 |
| 0.44330262225372075 | 1 |
| 0.443656980864635 | 1 |
| 0.44401133947554927 | 1 |
| 0.44436569808646353 | 1 |
| 0.4447200566973778 | 1 |
| 0.44507441530829195 | 1 |
| 0.4454287739192062 | 1 |
| 0.4457831325301205 | 1 |
| 0.44613749114103474 | 1 |
| 0.446491849751949 | 1 |
| 0.44684620836286326 | 1 |
| 0.4472005669737774 | 1 |
| 0.4475549255846917 | 1 |
| 0.44790928419560594 | 1 |
| 0.4482636428065202 | 1 |
| 0.44861800141743446 | 1 |
| 0.4489723600283487 | 1 |
| 0.4493267186392629 | 1 |
| 0.44968107725017714 | 1 |
| 0.4500354358610914 | 1 |
| 0.45038979447200567 | 1 |
| 0.45074415308291993 | 1 |
| 0.4510985116938342 | 1 |
| 0.45145287030474845 | 1 |
| 0.4518072289156626 | 1 |
| 0.45216158752657687 | 1 |
| 0.45251594613749113 | 1 |
| 0.4528703047484054 | 1 |
| 0.45322466335931966 | 1 |
| 0.4535790219702339 | 1 |
| 0.45393338058114807 | 1 |
| 0.45428773919206233 | 1 |
| 0.4546420978029766 | 1 |
| 0.45499645641389086 | 1 |
| 0.4553508150248051 | 1 |
| 0.4557051736357194 | 1 |
| 0.45605953224663365 | 1 |
| 0.4564138908575478 | 1 |
| 0.45676824946846206 | 1 |
| 0.4571226080793763 | 1 |
| 0.4574769666902906 | 1 |
| 0.45783132530120485 | 1 |
| 0.4581856839121191 | 1 |
| 0.45854004252303326 | 1 |
| 0.4588944011339475 | 1 |
| 0.4592487597448618 | 1 |
| 0.45960311835577605 | 1 |
| 0.4599574769666903 | 1 |
| 0.4603118355776046 | 1 |
| 0.46066619418851873 | 1 |
| 0.461020552799433 | 1 |
| 0.46137491141034725 | 1 |
| 0.4617292700212615 | 1 |
| 0.4620836286321758 | 1 |
| 0.46243798724309004 | 1 |
| 0.4627923458540043 | 1 |
| 0.46314670446491846 | 1 |
| 0.4635010630758327 | 1 |
| 0.463855421686747 | 1 |
| 0.46420978029766125 | 1 |
| 0.4645641389085755 | 1 |
| 0.46491849751948977 | 1 |
| 0.4652728561304039 | 1 |
| 0.4656272147413182 | 1 |
| 0.46598157335223245 | 1 |
| 0.4663359319631467 | 1 |
| 0.466690290574061 | 1 |
| 0.46704464918497524 | 1 |
| 0.4673990077958894 | 1 |
| 0.46775336640680365 | 1 |
| 0.4681077250177179 | 1 |
| 0.4684620836286322 | 1 |
| 0.46881644223954644 | 1 |
| 0.4691708008504607 | 1 |
| 0.46952515946137496 | 1 |
| 0.4698795180722891 | 1 |
| 0.4702338766832034 | 1 |
| 0.47058823529411764 | 1 |
| 0.4709425939050319 | 1 |
| 0.47129695251594617 | 1 |
| 0.47165131112686043 | 1 |
| 0.4720056697377746 | 1 |
| 0.47236002834868884 | 1 |
| 0.4727143869596031 | 1 |
| 0.47306874557051737 | 1 |
| 0.47342310418143163 | 1 |
| 0.4737774627923459 | 1 |
| 0.47413182140326005 | 1 |
| 0.4744861800141743 | 1 |
| 0.47484053862508857 | 1 |
| 0.47519489723600283 | 1 |
| 0.4755492558469171 | 1 |
| 0.47590361445783136 | 1 |
| 0.4762579730687456 | 1 |
| 0.4766123316796598 | 1 |
| 0.47696669029057404 | 1 |
| 0.4773210489014883 | 1 |
| 0.47767540751240256 | 1 |
| 0.4780297661233168 | 1 |
| 0.4783841247342311 | 1 |
| 0.47873848334514524 | 1 |
| 0.4790928419560595 | 1 |
| 0.47944720056697376 | 1 |
| 0.479801559177888 | 1 |
| 0.4801559177888023 | 1 |
| 0.48051027639971655 | 1 |
| 0.4808646350106307 | 1 |
| 0.48121899362154497 | 1 |
| 0.48157335223245923 | 1 |
| 0.4819277108433735 | 1 |
| 0.48228206945428775 | 1 |
| 0.482636428065202 | 1 |
| 0.4829907866761163 | 1 |
| 0.48334514528703043 | 1 |
| 0.4836995038979447 | 1 |
| 0.48405386250885896 | 1 |
| 0.4844082211197732 | 1 |
| 0.4847625797306875 | 1 |
| 0.48511693834160174 | 1 |
| 0.4854712969525159 | 1 |
| 0.48582565556343016 | 1 |
| 0.4861800141743444 | 1 |
| 0.4865343727852587 | 1 |
| 0.48688873139617295 | 1 |
| 0.4872430900070872 | 1 |
| 0.48759744861800147 | 1 |
| 0.4879518072289156 | 1 |
| 0.4883061658398299 | 1 |
| 0.48866052445074415 | 1 |
| 0.4890148830616584 | 1 |
| 0.4893692416725727 | 1 |
| 0.48972360028348694 | 1 |
| 0.4900779588944011 | 1 |
| 0.49043231750531535 | 1 |
| 0.4907866761162296 | 1 |
| 0.4911410347271439 | 1 |
| 0.49149539333805814 | 1 |
| 0.4918497519489724 | 1 |
| 0.49220411055988655 | 1 |
| 0.4925584691708008 | 1 |
| 0.4929128277817151 | 1 |
| 0.49326718639262934 | 1 |
| 0.4936215450035436 | 1 |
| 0.49397590361445787 | 1 |
| 0.49433026222537213 | 1 |
| 0.4946846208362863 | 1 |
| 0.49503897944720054 | 1 |
| 0.4953933380581148 | 1 |
| 0.49574769666902907 | 1 |
| 0.49610205527994333 | 1 |
| 0.4964564138908576 | 1 |
| 0.49681077250177175 | 1 |
| 0.497165131112686 | 1 |
| 0.49751948972360027 | 1 |
| 0.49787384833451453 | 1 |
| 0.4982282069454288 | 1 |
| 0.49858256555634306 | 1 |
| 0.4989369241672572 | 1 |
| 0.4992912827781715 | 1 |
| 0.49964564138908574 | 1 |
| 0.5 | 1 |
| 0.5003543586109143 | 1 |
| 0.5007087172218285 | 1 |
| 0.5010630758327428 | 1 |
| 0.501417434443657 | 1 |
| 0.5017717930545712 | 1 |
| 0.5021261516654855 | 1 |
| 0.5024805102763997 | 1 |
| 0.5028348688873139 | 1 |
| 0.5031892274982281 | 1 |
| 0.5035435861091424 | 1 |
| 0.5038979447200567 | 1 |
| 0.5042523033309709 | 1 |
| 0.5046066619418852 | 1 |
| 0.5049610205527995 | 1 |
| 0.5053153791637137 | 1 |
| 0.505669737774628 | 1 |
| 0.5060240963855422 | 1 |
| 0.5063784549964564 | 1 |
| 0.5067328136073707 | 1 |
| 0.5070871722182849 | 1 |
| 0.5074415308291991 | 1 |
| 0.5077958894401133 | 1 |
| 0.5081502480510276 | 1 |
| 0.5085046066619419 | 1 |
| 0.5088589652728561 | 1 |
| 0.5092133238837704 | 1 |
| 0.5095676824946846 | 1 |
| 0.5099220411055989 | 1 |
| 0.5102763997165132 | 1 |
| 0.5106307583274274 | 1 |
| 0.5109851169383416 | 1 |
| 0.5113394755492559 | 1 |
| 0.5116938341601701 | 1 |
| 0.5120481927710843 | 1 |
| 0.5124025513819985 | 1 |
| 0.5127569099929128 | 1 |
| 0.513111268603827 | 1 |
| 0.5134656272147413 | 1 |
| 0.5138199858256556 | 1 |
| 0.5141743444365698 | 1 |
| 0.5145287030474841 | 1 |
| 0.5148830616583984 | 1 |
| 0.5152374202693125 | 1 |
| 0.5155917788802268 | 1 |
| 0.515946137491141 | 1 |
| 0.5163004961020553 | 1 |
| 0.5166548547129695 | 1 |
| 0.5170092133238837 | 1 |
| 0.517363571934798 | 1 |
| 0.5177179305457122 | 1 |
| 0.5180722891566265 | 1 |
| 0.5184266477675408 | 1 |
| 0.518781006378455 | 1 |
| 0.5191353649893693 | 1 |
| 0.5194897236002836 | 1 |
| 0.5198440822111977 | 1 |
| 0.520198440822112 | 1 |
| 0.5205527994330262 | 1 |
| 0.5209071580439404 | 1 |
| 0.5212615166548547 | 1 |
| 0.5216158752657689 | 1 |
| 0.5219702338766832 | 1 |
| 0.5223245924875974 | 1 |
| 0.5226789510985117 | 1 |
| 0.523033309709426 | 1 |
| 0.5233876683203402 | 1 |
| 0.5237420269312545 | 1 |
| 0.5240963855421688 | 1 |
| 0.5244507441530829 | 1 |
| 0.5248051027639972 | 1 |
| 0.5251594613749114 | 1 |
| 0.5255138199858256 | 1 |
| 0.5258681785967398 | 1 |
| 0.5262225372076541 | 1 |
| 0.5265768958185684 | 1 |
| 0.5269312544294826 | 1 |
| 0.5272856130403969 | 1 |
| 0.5276399716513112 | 1 |
| 0.5279943302622254 | 1 |
| 0.5283486888731397 | 1 |
| 0.528703047484054 | 1 |
| 0.5290574060949681 | 1 |
| 0.5294117647058824 | 1 |
| 0.5297661233167966 | 1 |
| 0.5301204819277108 | 1 |
| 0.530474840538625 | 1 |
| 0.5308291991495393 | 1 |
| 0.5311835577604536 | 1 |
| 0.5315379163713678 | 1 |
| 0.5318922749822821 | 1 |
| 0.5322466335931963 | 1 |
| 0.5326009922041106 | 1 |
| 0.5329553508150249 | 1 |
| 0.533309709425939 | 1 |
| 0.5336640680368533 | 1 |
| 0.5340184266477676 | 1 |
| 0.5343727852586817 | 1 |
| 0.534727143869596 | 1 |
| 0.5350815024805102 | 1 |
| 0.5354358610914245 | 1 |
| 0.5357902197023388 | 1 |
| 0.536144578313253 | 1 |
| 0.5364989369241673 | 1 |
| 0.5368532955350815 | 1 |
| 0.5372076541459958 | 1 |
| 0.5375620127569101 | 1 |
| 0.5379163713678242 | 1 |
| 0.5382707299787385 | 1 |
| 0.5386250885896527 | 1 |
| 0.5389794472005669 | 1 |
| 0.5393338058114812 | 1 |
| 0.5396881644223954 | 1 |
| 0.5400425230333097 | 1 |
| 0.540396881644224 | 1 |
| 0.5407512402551382 | 1 |
| 0.5411055988660525 | 1 |
| 0.5414599574769667 | 1 |
| 0.541814316087881 | 1 |
| 0.5421686746987953 | 1 |
| 0.5425230333097094 | 1 |
| 0.5428773919206237 | 1 |
| 0.5432317505315379 | 1 |
| 0.5435861091424521 | 1 |
| 0.5439404677533664 | 1 |
| 0.5442948263642806 | 1 |
| 0.5446491849751949 | 1 |
| 0.5450035435861091 | 1 |
| 0.5453579021970234 | 1 |
| 0.5457122608079377 | 1 |
| 0.5460666194188519 | 1 |
| 0.5464209780297662 | 1 |
| 0.5467753366406803 | 1 |
| 0.5471296952515946 | 1 |
| 0.5474840538625089 | 1 |
| 0.5478384124734231 | 1 |
| 0.5481927710843373 | 1 |
| 0.5485471296952515 | 1 |
| 0.5489014883061658 | 1 |
| 0.5492558469170801 | 1 |
| 0.5496102055279943 | 1 |
| 0.5499645641389086 | 1 |
| 0.5503189227498229 | 1 |
| 0.5506732813607371 | 1 |
| 0.5510276399716514 | 1 |
| 0.5513819985825655 | 1 |
| 0.5517363571934798 | 1 |
| 0.5520907158043941 | 1 |
| 0.5524450744153082 | 1 |
| 0.5527994330262225 | 1 |
| 0.5531537916371367 | 1 |
| 0.553508150248051 | 1 |
| 0.5538625088589653 | 1 |
| 0.5542168674698795 | 1 |
| 0.5545712260807938 | 1 |
| 0.554925584691708 | 1 |
| 0.5552799433026223 | 1 |
| 0.5556343019135366 | 1 |
| 0.5559886605244507 | 1 |
| 0.556343019135365 | 1 |
| 0.5566973777462793 | 1 |
| 0.5570517363571934 | 1 |
| 0.5574060949681077 | 1 |
| 0.5577604535790219 | 1 |
| 0.5581148121899362 | 1 |
| 0.5584691708008505 | 1 |
| 0.5588235294117647 | 1 |
| 0.559177888022679 | 1 |
| 0.5595322466335932 | 1 |
| 0.5598866052445075 | 1 |
| 0.5602409638554218 | 1 |
| 0.5605953224663359 | 1 |
| 0.5609496810772502 | 1 |
| 0.5613040396881644 | 1 |
| 0.5616583982990786 | 1 |
| 0.5620127569099929 | 1 |
| 0.5623671155209071 | 1 |
| 0.5627214741318214 | 1 |
| 0.5630758327427356 | 1 |
| 0.5634301913536499 | 1 |
| 0.5637845499645642 | 1 |
| 0.5641389085754784 | 1 |
| 0.5644932671863927 | 1 |
| 0.5648476257973069 | 1 |
| 0.5652019844082211 | 1 |
| 0.5655563430191354 | 1 |
| 0.5659107016300495 | 1 |
| 0.5662650602409638 | 1 |
| 0.566619418851878 | 1 |
| 0.5669737774627923 | 1 |
| 0.5673281360737066 | 1 |
| 0.5676824946846208 | 1 |
| 0.5680368532955351 | 1 |
| 0.5683912119064494 | 1 |
| 0.5687455705173636 | 1 |
| 0.5690999291282779 | 1 |
| 0.569454287739192 | 1 |
| 0.5698086463501063 | 1 |
| 0.5701630049610206 | 1 |
| 0.5705173635719347 | 1 |
| 0.570871722182849 | 1 |
| 0.5712260807937632 | 1 |
| 0.5715804394046775 | 1 |
| 0.5719347980155918 | 1 |
| 0.572289156626506 | 1 |
| 0.5726435152374203 | 1 |
| 0.5729978738483346 | 1 |
| 0.5733522324592488 | 1 |
| 0.5737065910701631 | 1 |
| 0.5740609496810772 | 1 |
| 0.5744153082919915 | 1 |
| 0.5747696669029058 | 1 |
| 0.5751240255138199 | 1 |
| 0.5754783841247342 | 1 |
| 0.5758327427356484 | 1 |
| 0.5761871013465627 | 1 |
| 0.576541459957477 | 1 |
| 0.5768958185683912 | 1 |
| 0.5772501771793055 | 1 |
| 0.5776045357902198 | 1 |
| 0.577958894401134 | 1 |
| 0.5783132530120482 | 1 |
| 0.5786676116229624 | 1 |
| 0.5790219702338767 | 1 |
| 0.579376328844791 | 1 |
| 0.5797306874557051 | 1 |
| 0.5800850460666194 | 1 |
| 0.5804394046775336 | 1 |
| 0.5807937632884479 | 1 |
| 0.5811481218993622 | 1 |
| 0.5815024805102764 | 1 |
| 0.5818568391211907 | 1 |
| 0.582211197732105 | 1 |
| 0.5825655563430192 | 1 |
| 0.5829199149539334 | 1 |
| 0.5832742735648476 | 1 |
| 0.5836286321757619 | 1 |
| 0.583982990786676 | 1 |
| 0.5843373493975903 | 1 |
| 0.5846917080085046 | 1 |
| 0.5850460666194188 | 1 |
| 0.5854004252303331 | 1 |
| 0.5857547838412474 | 1 |
| 0.5861091424521616 | 1 |
| 0.5864635010630759 | 1 |
| 0.5868178596739901 | 1 |
| 0.5871722182849044 | 1 |
| 0.5875265768958186 | 1 |
| 0.5878809355067328 | 1 |
| 0.5882352941176471 | 1 |
| 0.5885896527285612 | 1 |
| 0.5889440113394755 | 1 |
| 0.5892983699503898 | 1 |
| 0.589652728561304 | 1 |
| 0.5900070871722183 | 1 |
| 0.5903614457831325 | 1 |
| 0.5907158043940468 | 1 |
| 0.5910701630049611 | 1 |
| 0.5914245216158753 | 1 |
| 0.5917788802267896 | 1 |
| 0.5921332388377037 | 1 |
| 0.592487597448618 | 1 |
| 0.5928419560595323 | 1 |
| 0.5931963146704464 | 1 |
| 0.5935506732813607 | 1 |
| 0.593905031892275 | 1 |
| 0.5942593905031892 | 1 |
| 0.5946137491141035 | 1 |
| 0.5949681077250177 | 1 |
| 0.595322466335932 | 1 |
| 0.5956768249468463 | 1 |
| 0.5960311835577605 | 1 |
| 0.5963855421686747 | 1 |
| 0.5967399007795889 | 1 |
| 0.5970942593905032 | 1 |
| 0.5974486180014174 | 1 |
| 0.5978029766123316 | 1 |
| 0.5981573352232459 | 1 |
| 0.5985116938341601 | 1 |
| 0.5988660524450744 | 1 |
| 0.5992204110559887 | 1 |
| 0.5995747696669029 | 1 |
| 0.5999291282778172 | 1 |
| 0.6002834868887315 | 1 |
| 0.6006378454996457 | 1 |
| 0.6009922041105599 | 1 |
| 0.6013465627214741 | 1 |
| 0.6017009213323884 | 1 |
| 0.6020552799433025 | 1 |
| 0.6024096385542168 | 1 |
| 0.6027639971651311 | 1 |
| 0.6031183557760453 | 1 |
| 0.6034727143869596 | 1 |
| 0.6038270729978739 | 1 |
| 0.6041814316087881 | 1 |
| 0.6045357902197024 | 1 |
| 0.6048901488306166 | 1 |
| 0.6052445074415309 | 1 |
| 0.6055988660524451 | 1 |
| 0.6059532246633593 | 1 |
| 0.6063075832742736 | 1 |
| 0.6066619418851877 | 1 |
| 0.607016300496102 | 1 |
| 0.6073706591070163 | 1 |
| 0.6077250177179305 | 1 |
| 0.6080793763288448 | 1 |
| 0.608433734939759 | 1 |
| 0.6087880935506733 | 1 |
| 0.6091424521615876 | 1 |
| 0.6094968107725018 | 1 |
| 0.609851169383416 | 1 |
| 0.6102055279943303 | 1 |
| 0.6105598866052445 | 1 |
| 0.6109142452161588 | 1 |
| 0.6112686038270729 | 1 |
| 0.6116229624379872 | 1 |
| 0.6119773210489015 | 1 |
| 0.6123316796598157 | 1 |
| 0.61268603827073 | 1 |
| 0.6130403968816442 | 1 |
| 0.6133947554925585 | 1 |
| 0.6137491141034728 | 1 |
| 0.614103472714387 | 1 |
| 0.6144578313253012 | 1 |
| 0.6148121899362154 | 1 |
| 0.6151665485471297 | 1 |
| 0.6155209071580439 | 1 |
| 0.6158752657689581 | 1 |
| 0.6162296243798724 | 1 |
| 0.6165839829907866 | 1 |
| 0.6169383416017009 | 1 |
| 0.6172927002126152 | 1 |
| 0.6176470588235294 | 1 |
| 0.6180014174344437 | 1 |
| 0.618355776045358 | 1 |
| 0.6187101346562722 | 1 |
| 0.6190644932671864 | 1 |
| 0.6194188518781006 | 1 |
| 0.6197732104890149 | 1 |
| 0.620127569099929 | 1 |
| 0.6204819277108433 | 1 |
| 0.6208362863217576 | 1 |
| 0.6211906449326718 | 1 |
| 0.6215450035435861 | 1 |
| 0.6218993621545004 | 1 |
| 0.6222537207654146 | 1 |
| 0.6226080793763289 | 1 |
| 0.6229624379872432 | 1 |
| 0.6233167965981573 | 1 |
| 0.6236711552090716 | 1 |
| 0.6240255138199858 | 1 |
| 0.6243798724309001 | 1 |
| 0.6247342310418142 | 1 |
| 0.6250885896527285 | 1 |
| 0.6254429482636428 | 1 |
| 0.625797306874557 | 1 |
| 0.6261516654854713 | 1 |
| 0.6265060240963856 | 1 |
| 0.6268603827072998 | 1 |
| 0.6272147413182141 | 1 |
| 0.6275690999291283 | 1 |
| 0.6279234585400425 | 1 |
| 0.6282778171509568 | 1 |
| 0.628632175761871 | 1 |
| 0.6289865343727852 | 1 |
| 0.6293408929836994 | 1 |
| 0.6296952515946137 | 1 |
| 0.630049610205528 | 1 |
| 0.6304039688164422 | 1 |
| 0.6307583274273565 | 1 |
| 0.6311126860382708 | 1 |
| 0.631467044649185 | 1 |
| 0.6318214032600993 | 1 |
| 0.6321757618710135 | 1 |
| 0.6325301204819277 | 1 |
| 0.632884479092842 | 1 |
| 0.6332388377037562 | 1 |
| 0.6335931963146704 | 1 |
| 0.6339475549255846 | 1 |
| 0.6343019135364989 | 1 |
| 0.6346562721474132 | 1 |
| 0.6350106307583274 | 1 |
| 0.6353649893692417 | 1 |
| 0.635719347980156 | 1 |
| 0.6360737065910702 | 1 |
| 0.6364280652019845 | 1 |
| 0.6367824238128987 | 1 |
| 0.6371367824238129 | 1 |
| 0.6374911410347271 | 1 |
| 0.6378454996456414 | 1 |
| 0.6381998582565556 | 1 |
| 0.6385542168674698 | 1 |
| 0.6389085754783841 | 1 |
| 0.6392629340892984 | 1 |
| 0.6396172927002126 | 1 |
| 0.6399716513111269 | 1 |
| 0.6403260099220411 | 1 |
| 0.6406803685329554 | 1 |
| 0.6410347271438697 | 1 |
| 0.6413890857547838 | 1 |
| 0.6417434443656981 | 1 |
| 0.6420978029766123 | 1 |
| 0.6424521615875266 | 1 |
| 0.6428065201984408 | 1 |
| 0.643160878809355 | 1 |
| 0.6435152374202693 | 1 |
| 0.6438695960311835 | 1 |
| 0.6442239546420978 | 1 |
| 0.6445783132530121 | 1 |
| 0.6449326718639263 | 1 |
| 0.6452870304748406 | 1 |
| 0.6456413890857549 | 1 |
| 0.645995747696669 | 1 |
| 0.6463501063075833 | 1 |
| 0.6467044649184975 | 1 |
| 0.6470588235294117 | 1 |
| 0.647413182140326 | 1 |
| 0.6477675407512402 | 1 |
| 0.6481218993621545 | 1 |
| 0.6484762579730687 | 1 |
| 0.648830616583983 | 1 |
| 0.6491849751948973 | 1 |
| 0.6495393338058115 | 1 |
| 0.6498936924167258 | 1 |
| 0.65024805102764 | 1 |
| 0.6506024096385542 | 1 |
| 0.6509567682494685 | 1 |
| 0.6513111268603827 | 1 |
| 0.6516654854712969 | 1 |
| 0.6520198440822111 | 1 |
| 0.6523742026931254 | 1 |
| 0.6527285613040397 | 1 |
| 0.6530829199149539 | 1 |
| 0.6534372785258682 | 1 |
| 0.6537916371367825 | 1 |
| 0.6541459957476967 | 1 |
| 0.654500354358611 | 1 |
| 0.6548547129695251 | 1 |
| 0.6552090715804394 | 1 |
| 0.6555634301913537 | 1 |
| 0.6559177888022679 | 1 |
| 0.6562721474131821 | 1 |
| 0.6566265060240963 | 1 |
| 0.6569808646350106 | 1 |
| 0.6573352232459249 | 1 |
| 0.6576895818568391 | 1 |
| 0.6580439404677534 | 1 |
| 0.6583982990786676 | 1 |
| 0.6587526576895819 | 1 |
| 0.6591070163004962 | 1 |
| 0.6594613749114103 | 1 |
| 0.6598157335223246 | 1 |
| 0.6601700921332389 | 1 |
| 0.660524450744153 | 1 |
| 0.6608788093550673 | 1 |
| 0.6612331679659815 | 1 |
| 0.6615875265768958 | 1 |
| 0.66194188518781 | 1 |
| 0.6622962437987243 | 1 |
| 0.6626506024096386 | 1 |
| 0.6630049610205528 | 1 |
| 0.6633593196314671 | 1 |
| 0.6637136782423814 | 1 |
| 0.6640680368532955 | 1 |
| 0.6644223954642098 | 1 |
| 0.664776754075124 | 1 |
| 0.6651311126860382 | 1 |
| 0.6654854712969525 | 1 |
| 0.6658398299078667 | 1 |
| 0.666194188518781 | 1 |
| 0.6665485471296952 | 1 |
| 0.6669029057406095 | 1 |
| 0.6672572643515238 | 1 |
| 0.667611622962438 | 1 |
| 0.6679659815733523 | 1 |
| 0.6683203401842666 | 1 |
| 0.6686746987951807 | 1 |
| 0.669029057406095 | 1 |
| 0.6693834160170092 | 1 |
| 0.6697377746279234 | 1 |
| 0.6700921332388377 | 1 |
| 0.6704464918497519 | 1 |
| 0.6708008504606662 | 1 |
| 0.6711552090715804 | 1 |
| 0.6715095676824947 | 1 |
| 0.671863926293409 | 1 |
| 0.6722182849043232 | 1 |
| 0.6725726435152375 | 1 |
| 0.6729270021261516 | 1 |
| 0.6732813607370659 | 1 |
| 0.6736357193479802 | 1 |
| 0.6739900779588943 | 1 |
| 0.6743444365698086 | 1 |
| 0.6746987951807228 | 1 |
| 0.6750531537916371 | 1 |
| 0.6754075124025514 | 1 |
| 0.6757618710134656 | 1 |
| 0.6761162296243799 | 1 |
| 0.6764705882352942 | 1 |
| 0.6768249468462084 | 1 |
| 0.6771793054571227 | 1 |
| 0.6775336640680368 | 1 |
| 0.6778880226789511 | 1 |
| 0.6782423812898654 | 1 |
| 0.6785967399007795 | 1 |
| 0.6789510985116938 | 1 |
| 0.679305457122608 | 1 |
| 0.6796598157335223 | 1 |
| 0.6800141743444366 | 1 |
| 0.6803685329553508 | 1 |
| 0.6807228915662651 | 1 |
| 0.6810772501771793 | 1 |
| 0.6814316087880936 | 1 |
| 0.6817859673990079 | 1 |
| 0.682140326009922 | 1 |
| 0.6824946846208363 | 1 |
| 0.6828490432317506 | 1 |
| 0.6832034018426647 | 1 |
| 0.683557760453579 | 1 |
| 0.6839121190644932 | 1 |
| 0.6842664776754075 | 1 |
| 0.6846208362863218 | 1 |
| 0.684975194897236 | 1 |
| 0.6853295535081503 | 1 |
| 0.6856839121190645 | 1 |
| 0.6860382707299788 | 1 |
| 0.686392629340893 | 1 |
| 0.6867469879518072 | 1 |
| 0.6871013465627215 | 1 |
| 0.6874557051736357 | 1 |
| 0.6878100637845499 | 1 |
| 0.6881644223954642 | 1 |
| 0.6885187810063784 | 1 |
| 0.6888731396172927 | 1 |
| 0.689227498228207 | 1 |
| 0.6895818568391212 | 1 |
| 0.6899362154500355 | 1 |
| 0.6902905740609497 | 1 |
| 0.690644932671864 | 1 |
| 0.6909992912827781 | 1 |
| 0.6913536498936924 | 1 |
| 0.6917080085046067 | 1 |
| 0.6920623671155208 | 1 |
| 0.6924167257264351 | 1 |
| 0.6927710843373494 | 1 |
| 0.6931254429482636 | 1 |
| 0.6934798015591779 | 1 |
| 0.6938341601700921 | 1 |
| 0.6941885187810064 | 1 |
| 0.6945428773919207 | 1 |
| 0.6948972360028349 | 1 |
| 0.6952515946137492 | 1 |
| 0.6956059532246633 | 1 |
| 0.6959603118355776 | 1 |
| 0.6963146704464919 | 1 |
| 0.696669029057406 | 1 |
| 0.6970233876683203 | 1 |
| 0.6973777462792345 | 1 |
| 0.6977321048901488 | 1 |
| 0.6980864635010631 | 1 |
| 0.6984408221119773 | 1 |
| 0.6987951807228916 | 1 |
| 0.6991495393338059 | 1 |
| 0.6995038979447201 | 1 |
| 0.6998582565556344 | 1 |
| 0.7002126151665485 | 1 |
| 0.7005669737774628 | 1 |
| 0.7009213323883771 | 1 |
| 0.7012756909992912 | 1 |
| 0.7016300496102055 | 1 |
| 0.7019844082211197 | 1 |
| 0.702338766832034 | 1 |
| 0.7026931254429483 | 1 |
| 0.7030474840538625 | 1 |
| 0.7034018426647768 | 1 |
| 0.703756201275691 | 1 |
| 0.7041105598866053 | 1 |
| 0.7044649184975195 | 1 |
| 0.7048192771084337 | 1 |
| 0.705173635719348 | 1 |
| 0.7055279943302621 | 1 |
| 0.7058823529411764 | 1 |
| 0.7062367115520907 | 1 |
| 0.7065910701630049 | 1 |
| 0.7069454287739192 | 1 |
| 0.7072997873848335 | 1 |
| 0.7076541459957477 | 1 |
| 0.708008504606662 | 1 |
| 0.7083628632175762 | 1 |
| 0.7087172218284905 | 1 |
| 0.7090715804394047 | 1 |
| 0.7094259390503189 | 1 |
| 0.7097802976612332 | 1 |
| 0.7101346562721473 | 1 |
| 0.7104890148830616 | 1 |
| 0.7108433734939759 | 1 |
| 0.7111977321048901 | 1 |
| 0.7115520907158044 | 1 |
| 0.7119064493267186 | 1 |
| 0.7122608079376329 | 1 |
| 0.7126151665485472 | 1 |
| 0.7129695251594614 | 1 |
| 0.7133238837703757 | 1 |
| 0.7136782423812899 | 1 |
| 0.7140326009922041 | 1 |
| 0.7143869596031184 | 1 |
| 0.7147413182140325 | 1 |
| 0.7150956768249468 | 1 |
| 0.715450035435861 | 1 |
| 0.7158043940467753 | 1 |
| 0.7161587526576896 | 1 |
| 0.7165131112686038 | 1 |
| 0.7168674698795181 | 1 |
| 0.7172218284904324 | 1 |
| 0.7175761871013466 | 1 |
| 0.7179305457122608 | 1 |
| 0.718284904323175 | 1 |
| 0.7186392629340893 | 1 |
| 0.7189936215450036 | 1 |
| 0.7193479801559177 | 1 |
| 0.719702338766832 | 1 |
| 0.7200566973777462 | 1 |
| 0.7204110559886605 | 1 |
| 0.7207654145995748 | 1 |
| 0.721119773210489 | 1 |
| 0.7214741318214033 | 1 |
| 0.7218284904323176 | 1 |
| 0.7221828490432318 | 1 |
| 0.722537207654146 | 1 |
| 0.7228915662650602 | 1 |
| 0.7232459248759745 | 1 |
| 0.7236002834868887 | 1 |
| 0.7239546420978029 | 1 |
| 0.7243090007087172 | 1 |
| 0.7246633593196314 | 1 |
| 0.7250177179305457 | 1 |
| 0.72537207654146 | 1 |
| 0.7257264351523742 | 1 |
| 0.7260807937632885 | 1 |
| 0.7264351523742028 | 1 |
| 0.726789510985117 | 1 |
| 0.7271438695960312 | 1 |
| 0.7274982282069454 | 1 |
| 0.7278525868178597 | 1 |
| 0.7282069454287738 | 1 |
| 0.7285613040396881 | 1 |
| 0.7289156626506024 | 1 |
| 0.7292700212615166 | 1 |
| 0.7296243798724309 | 1 |
| 0.7299787384833452 | 1 |
| 0.7303330970942594 | 1 |
| 0.7306874557051737 | 1 |
| 0.731041814316088 | 1 |
| 0.7313961729270022 | 1 |
| 0.7317505315379164 | 1 |
| 0.7321048901488306 | 1 |
| 0.7324592487597449 | 1 |
| 0.732813607370659 | 1 |
| 0.7331679659815733 | 1 |
| 0.7335223245924876 | 1 |
| 0.7338766832034018 | 1 |
| 0.7342310418143161 | 1 |
| 0.7345854004252304 | 1 |
| 0.7349397590361446 | 1 |
| 0.7352941176470589 | 1 |
| 0.7356484762579731 | 1 |
| 0.7360028348688873 | 1 |
| 0.7363571934798016 | 1 |
| 0.7367115520907158 | 1 |
| 0.73706591070163 | 1 |
| 0.7374202693125442 | 1 |
| 0.7377746279234585 | 1 |
| 0.7381289865343728 | 1 |
| 0.738483345145287 | 1 |
| 0.7388377037562013 | 1 |
| 0.7391920623671155 | 1 |
| 0.7395464209780298 | 1 |
| 0.7399007795889441 | 1 |
| 0.7402551381998583 | 1 |
| 0.7406094968107725 | 1 |
| 0.7409638554216867 | 1 |
| 0.741318214032601 | 1 |
| 0.7416725726435152 | 1 |
| 0.7420269312544294 | 1 |
| 0.7423812898653437 | 1 |
| 0.742735648476258 | 1 |
| 0.7430900070871722 | 1 |
| 0.7434443656980865 | 1 |
| 0.7437987243090007 | 1 |
| 0.744153082919915 | 1 |
| 0.7445074415308293 | 1 |
| 0.7448618001417435 | 1 |
| 0.7452161587526577 | 1 |
| 0.7455705173635719 | 1 |
| 0.7459248759744862 | 1 |
| 0.7462792345854004 | 1 |
| 0.7466335931963146 | 1 |
| 0.7469879518072289 | 1 |
| 0.7473423104181431 | 1 |
| 0.7476966690290574 | 1 |
| 0.7480510276399717 | 1 |
| 0.7484053862508859 | 1 |
| 0.7487597448618002 | 1 |
| 0.7491141034727145 | 1 |
| 0.7494684620836286 | 1 |
| 0.7498228206945429 | 1 |
| 0.7501771793054571 | 1 |
| 0.7505315379163714 | 1 |
| 0.7508858965272855 | 1 |
| 0.7512402551381998 | 1 |
| 0.7515946137491141 | 1 |
| 0.7519489723600283 | 1 |
| 0.7523033309709426 | 1 |
| 0.7526576895818569 | 1 |
| 0.7530120481927711 | 1 |
| 0.7533664068036854 | 1 |
| 0.7537207654145995 | 1 |
| 0.7540751240255138 | 1 |
| 0.7544294826364281 | 1 |
| 0.7547838412473423 | 1 |
| 0.7551381998582566 | 1 |
| 0.7554925584691707 | 1 |
| 0.755846917080085 | 1 |
| 0.7562012756909993 | 1 |
| 0.7565556343019135 | 1 |
| 0.7569099929128278 | 1 |
| 0.757264351523742 | 1 |
| 0.7576187101346563 | 1 |
| 0.7579730687455706 | 1 |
| 0.7583274273564847 | 1 |
| 0.758681785967399 | 1 |
| 0.7590361445783133 | 1 |
| 0.7593905031892275 | 1 |
| 0.7597448618001418 | 1 |
| 0.7600992204110559 | 1 |
| 0.7604535790219702 | 1 |
| 0.7608079376328845 | 1 |
| 0.7611622962437987 | 1 |
| 0.761516654854713 | 1 |
| 0.7618710134656272 | 1 |
| 0.7622253720765415 | 1 |
| 0.7625797306874558 | 1 |
| 0.7629340892983699 | 1 |
| 0.7632884479092842 | 1 |
| 0.7636428065201984 | 1 |
| 0.7639971651311127 | 1 |
| 0.764351523742027 | 1 |
| 0.7647058823529411 | 1 |
| 0.7650602409638554 | 1 |
| 0.7654145995747696 | 1 |
| 0.7657689581856839 | 1 |
| 0.7661233167965982 | 1 |
| 0.7664776754075124 | 1 |
| 0.7668320340184267 | 1 |
| 0.7671863926293409 | 1 |
| 0.7675407512402551 | 1 |
| 0.7678951098511694 | 1 |
| 0.7682494684620836 | 1 |
| 0.7686038270729979 | 1 |
| 0.768958185683912 | 1 |
| 0.7693125442948263 | 1 |
| 0.7696669029057406 | 1 |
| 0.7700212615166548 | 1 |
| 0.7703756201275691 | 1 |
| 0.7707299787384834 | 1 |
| 0.7710843373493976 | 1 |
| 0.7714386959603119 | 1 |
| 0.771793054571226 | 1 |
| 0.7721474131821403 | 1 |
| 0.7725017717930546 | 1 |
| 0.7728561304039688 | 1 |
| 0.7732104890148831 | 1 |
| 0.7735648476257972 | 1 |
| 0.7739192062367115 | 1 |
| 0.7742735648476258 | 1 |
| 0.77462792345854 | 1 |
| 0.7749822820694543 | 1 |
| 0.7753366406803686 | 1 |
| 0.7756909992912828 | 1 |
| 0.7760453579021971 | 1 |
| 0.7763997165131112 | 1 |
| 0.7767540751240255 | 1 |
| 0.7771084337349398 | 1 |
| 0.777462792345854 | 1 |
| 0.7778171509567683 | 1 |
| 0.7781715095676824 | 1 |
| 0.7785258681785967 | 1 |
| 0.778880226789511 | 1 |
| 0.7792345854004252 | 1 |
| 0.7795889440113395 | 1 |
| 0.7799433026222538 | 1 |
| 0.780297661233168 | 1 |
| 0.7806520198440823 | 1 |
| 0.7810063784549964 | 1 |
| 0.7813607370659107 | 1 |
| 0.781715095676825 | 1 |
| 0.7820694542877392 | 1 |
| 0.7824238128986534 | 1 |
| 0.7827781715095676 | 1 |
| 0.7831325301204819 | 1 |
| 0.7834868887313962 | 1 |
| 0.7838412473423104 | 1 |
| 0.7841956059532247 | 1 |
| 0.784549964564139 | 1 |
| 0.7849043231750532 | 1 |
| 0.7852586817859674 | 1 |
| 0.7856130403968816 | 1 |
| 0.7859673990077959 | 1 |
| 0.7863217576187101 | 1 |
| 0.7866761162296244 | 1 |
| 0.7870304748405386 | 1 |
| 0.7873848334514528 | 1 |
| 0.7877391920623671 | 1 |
| 0.7880935506732814 | 1 |
| 0.7884479092841956 | 1 |
| 0.7888022678951099 | 1 |
| 0.7891566265060241 | 1 |
| 0.7895109851169384 | 1 |
| 0.7898653437278526 | 1 |
| 0.7902197023387668 | 1 |
| 0.7905740609496811 | 1 |
| 0.7909284195605953 | 1 |
| 0.7912827781715096 | 1 |
| 0.7916371367824238 | 1 |
| 0.791991495393338 | 1 |
| 0.7923458540042523 | 1 |
| 0.7927002126151665 | 1 |
| 0.7930545712260808 | 1 |
| 0.7934089298369951 | 1 |
| 0.7937632884479093 | 1 |
| 0.7941176470588236 | 1 |
| 0.7944720056697377 | 1 |
| 0.794826364280652 | 1 |
| 0.7951807228915663 | 1 |
| 0.7955350815024805 | 1 |
| 0.7958894401133948 | 1 |
| 0.796243798724309 | 1 |
| 0.7965981573352232 | 1 |
| 0.7969525159461375 | 1 |
| 0.7973068745570517 | 1 |
| 0.797661233167966 | 1 |
| 0.7980155917788803 | 1 |
| 0.7983699503897945 | 1 |
| 0.7987243090007087 | 1 |
| 0.7990786676116229 | 1 |
| 0.7994330262225372 | 1 |
| 0.7997873848334515 | 1 |
| 0.8001417434443657 | 1 |
| 0.8004961020552799 | 1 |
| 0.8008504606661941 | 1 |
| 0.8012048192771084 | 1 |
| 0.8015591778880227 | 1 |
| 0.8019135364989369 | 1 |
| 0.8022678951098512 | 1 |
| 0.8026222537207655 | 1 |
| 0.8029766123316797 | 1 |
| 0.8033309709425939 | 1 |
| 0.8036853295535081 | 1 |
| 0.8040396881644224 | 1 |
| 0.8043940467753367 | 1 |
| 0.8047484053862509 | 1 |
| 0.8051027639971651 | 1 |
| 0.8054571226080793 | 1 |
| 0.8058114812189936 | 1 |
| 0.8061658398299079 | 1 |
| 0.8065201984408221 | 1 |
| 0.8068745570517364 | 1 |
| 0.8072289156626506 | 1 |
| 0.8075832742735649 | 1 |
| 0.8079376328844791 | 1 |
| 0.8082919914953933 | 1 |
| 0.8086463501063076 | 1 |
| 0.8090007087172219 | 1 |
| 0.8093550673281361 | 1 |
| 0.8097094259390503 | 1 |
| 0.8100637845499645 | 1 |
| 0.8104181431608788 | 1 |
| 0.810772501771793 | 1 |
| 0.8111268603827073 | 1 |
| 0.8114812189936216 | 1 |
| 0.8118355776045358 | 1 |
| 0.8121899362154501 | 1 |
| 0.8125442948263643 | 1 |
| 0.8128986534372785 | 1 |
| 0.8132530120481928 | 1 |
| 0.813607370659107 | 1 |
| 0.8139617292700212 | 1 |
| 0.8143160878809355 | 1 |
| 0.8146704464918497 | 1 |
| 0.815024805102764 | 1 |
| 0.8153791637136782 | 1 |
| 0.8157335223245925 | 1 |
| 0.8160878809355068 | 1 |
| 0.816442239546421 | 1 |
| 0.8167965981573352 | 1 |
| 0.8171509567682494 | 1 |
| 0.8175053153791637 | 1 |
| 0.817859673990078 | 1 |
| 0.8182140326009922 | 1 |
| 0.8185683912119064 | 1 |
| 0.8189227498228207 | 1 |
| 0.8192771084337349 | 1 |
| 0.8196314670446492 | 1 |
| 0.8199858256555634 | 1 |
| 0.8203401842664777 | 1 |
| 0.820694542877392 | 1 |
| 0.8210489014883062 | 1 |
| 0.8214032600992204 | 1 |
| 0.8217576187101346 | 1 |
| 0.8221119773210489 | 1 |
| 0.8224663359319632 | 1 |
| 0.8228206945428774 | 1 |
| 0.8231750531537916 | 1 |
| 0.8235294117647058 | 1 |
| 0.8238837703756201 | 1 |
| 0.8242381289865344 | 1 |
| 0.8245924875974486 | 1 |
| 0.8249468462083629 | 1 |
| 0.8253012048192772 | 1 |
| 0.8256555634301914 | 1 |
| 0.8260099220411056 | 1 |
| 0.8263642806520198 | 1 |
| 0.8267186392629341 | 1 |
| 0.8270729978738484 | 1 |
| 0.8274273564847625 | 1 |
| 0.8277817150956768 | 1 |
| 0.828136073706591 | 1 |
| 0.8284904323175053 | 1 |
| 0.8288447909284196 | 1 |
| 0.8291991495393338 | 1 |
| 0.8295535081502481 | 1 |
| 0.8299078667611623 | 1 |
| 0.8302622253720765 | 1 |
| 0.8306165839829908 | 1 |
| 0.830970942593905 | 1 |
| 0.8313253012048193 | 1 |
| 0.8316796598157336 | 1 |
| 0.8320340184266477 | 1 |
| 0.832388377037562 | 1 |
| 0.8327427356484762 | 1 |
| 0.8330970942593905 | 1 |
| 0.8334514528703048 | 1 |
| 0.833805811481219 | 1 |
| 0.8341601700921333 | 1 |
| 0.8345145287030475 | 1 |
| 0.8348688873139617 | 1 |
| 0.835223245924876 | 1 |
| 0.8355776045357902 | 1 |
| 0.8359319631467045 | 1 |
| 0.8362863217576187 | 1 |
| 0.8366406803685329 | 1 |
| 0.8369950389794472 | 1 |
| 0.8373493975903614 | 1 |
| 0.8377037562012757 | 1 |
| 0.83805811481219 | 1 |
| 0.8384124734231042 | 1 |
| 0.8387668320340185 | 1 |
| 0.8391211906449327 | 1 |
| 0.8394755492558469 | 1 |
| 0.8398299078667611 | 1 |
| 0.8401842664776754 | 1 |
| 0.8405386250885897 | 1 |
| 0.8408929836995039 | 1 |
| 0.8412473423104181 | 1 |
| 0.8416017009213324 | 1 |
| 0.8419560595322466 | 1 |
| 0.8423104181431609 | 1 |
| 0.8426647767540751 | 1 |
| 0.8430191353649894 | 1 |
| 0.8433734939759037 | 1 |
| 0.8437278525868179 | 1 |
| 0.8440822111977321 | 1 |
| 0.8444365698086463 | 1 |
| 0.8447909284195606 | 1 |
| 0.8451452870304749 | 1 |
| 0.845499645641389 | 1 |
| 0.8458540042523033 | 1 |
| 0.8462083628632175 | 1 |
| 0.8465627214741318 | 1 |
| 0.8469170800850461 | 1 |
| 0.8472714386959603 | 1 |
| 0.8476257973068746 | 1 |
| 0.8479801559177889 | 1 |
| 0.848334514528703 | 1 |
| 0.8486888731396173 | 1 |
| 0.8490432317505315 | 1 |
| 0.8493975903614458 | 1 |
| 0.8497519489723601 | 1 |
| 0.8501063075832742 | 1 |
| 0.8504606661941885 | 1 |
| 0.8508150248051027 | 1 |
| 0.851169383416017 | 1 |
| 0.8515237420269313 | 1 |
| 0.8518781006378455 | 1 |
| 0.8522324592487598 | 1 |
| 0.852586817859674 | 1 |
| 0.8529411764705882 | 1 |
| 0.8532955350815025 | 1 |
| 0.8536498936924167 | 1 |
| 0.854004252303331 | 1 |
| 0.8543586109142453 | 1 |
| 0.8547129695251594 | 1 |
| 0.8550673281360737 | 1 |
| 0.8554216867469879 | 1 |
| 0.8557760453579022 | 1 |
| 0.8561304039688165 | 1 |
| 0.8564847625797307 | 1 |
| 0.856839121190645 | 1 |
| 0.8571934798015592 | 1 |
| 0.8575478384124734 | 1 |
| 0.8579021970233877 | 1 |
| 0.8582565556343019 | 1 |
| 0.8586109142452162 | 1 |
| 0.8589652728561303 | 1 |
| 0.8593196314670446 | 1 |
| 0.8596739900779589 | 1 |
| 0.8600283486888731 | 1 |
| 0.8603827072997874 | 1 |
| 0.8607370659107016 | 1 |
| 0.8610914245216159 | 1 |
| 0.8614457831325302 | 1 |
| 0.8618001417434443 | 1 |
| 0.8621545003543586 | 1 |
| 0.8625088589652729 | 1 |
| 0.8628632175761871 | 1 |
| 0.8632175761871014 | 1 |
| 0.8635719347980155 | 1 |
| 0.8639262934089298 | 1 |
| 0.864280652019844 | 1 |
| 0.8646350106307583 | 1 |
| 0.8649893692416726 | 1 |
| 0.8653437278525868 | 1 |
| 0.8656980864635011 | 1 |
| 0.8660524450744154 | 1 |
| 0.8664068036853295 | 1 |
| 0.8667611622962438 | 1 |
| 0.867115520907158 | 1 |
| 0.8674698795180723 | 1 |
| 0.8678242381289866 | 1 |
| 0.8681785967399007 | 1 |
| 0.868532955350815 | 1 |
| 0.8688873139617292 | 1 |
| 0.8692416725726435 | 1 |
| 0.8695960311835578 | 1 |
| 0.869950389794472 | 1 |
| 0.8703047484053863 | 1 |
| 0.8706591070163006 | 1 |
| 0.8710134656272147 | 1 |
| 0.871367824238129 | 1 |
| 0.8717221828490432 | 1 |
| 0.8720765414599575 | 1 |
| 0.8724309000708718 | 1 |
| 0.8727852586817859 | 1 |
| 0.8731396172927002 | 1 |
| 0.8734939759036144 | 1 |
| 0.8738483345145287 | 1 |
| 0.874202693125443 | 1 |
| 0.8745570517363572 | 1 |
| 0.8749114103472715 | 1 |
| 0.8752657689581856 | 1 |
| 0.8756201275690999 | 1 |
| 0.8759744861800142 | 1 |
| 0.8763288447909284 | 1 |
| 0.8766832034018427 | 1 |
| 0.877037562012757 | 1 |
| 0.8773919206236711 | 1 |
| 0.8777462792345854 | 1 |
| 0.8781006378454996 | 1 |
| 0.8784549964564139 | 1 |
| 0.8788093550673282 | 1 |
| 0.8791637136782424 | 1 |
| 0.8795180722891567 | 1 |
| 0.8798724309000708 | 1 |
| 0.8802267895109851 | 1 |
| 0.8805811481218994 | 1 |
| 0.8809355067328136 | 1 |
| 0.8812898653437279 | 1 |
| 0.881644223954642 | 1 |
| 0.8819985825655563 | 1 |
| 0.8823529411764706 | 1 |
| 0.8827072997873848 | 1 |
| 0.8830616583982991 | 1 |
| 0.8834160170092134 | 1 |
| 0.8837703756201276 | 1 |
| 0.8841247342310419 | 1 |
| 0.884479092841956 | 1 |
| 0.8848334514528703 | 1 |
| 0.8851878100637846 | 1 |
| 0.8855421686746988 | 1 |
| 0.8858965272856131 | 1 |
| 0.8862508858965272 | 1 |
| 0.8866052445074415 | 1 |
| 0.8869596031183558 | 1 |
| 0.88731396172927 | 1 |
| 0.8876683203401843 | 1 |
| 0.8880226789510985 | 1 |
| 0.8883770375620128 | 1 |
| 0.888731396172927 | 1 |
| 0.8890857547838412 | 1 |
| 0.8894401133947555 | 1 |
| 0.8897944720056697 | 1 |
| 0.890148830616584 | 1 |
| 0.8905031892274983 | 1 |
| 0.8908575478384124 | 1 |
| 0.8912119064493267 | 1 |
| 0.891566265060241 | 1 |
| 0.8919206236711552 | 1 |
| 0.8922749822820695 | 1 |
| 0.8926293408929837 | 1 |
| 0.892983699503898 | 1 |
| 0.8933380581148122 | 1 |
| 0.8936924167257264 | 1 |
| 0.8940467753366407 | 1 |
| 0.8944011339475549 | 1 |
| 0.8947554925584692 | 1 |
| 0.8951098511693835 | 1 |
| 0.8954642097802976 | 1 |
| 0.8958185683912119 | 1 |
| 0.8961729270021261 | 1 |
| 0.8965272856130404 | 1 |
| 0.8968816442239547 | 1 |
| 0.8972360028348689 | 1 |
| 0.8975903614457832 | 1 |
| 0.8979447200566973 | 1 |
| 0.8982990786676116 | 1 |
| 0.8986534372785259 | 1 |
| 0.8990077958894401 | 1 |
| 0.8993621545003544 | 1 |
| 0.8997165131112685 | 1 |
| 0.9000708717221828 | 1 |
| 0.9004252303330971 | 1 |
| 0.9007795889440113 | 1 |
| 0.9011339475549256 | 1 |
| 0.9014883061658399 | 1 |
| 0.9018426647767541 | 1 |
| 0.9021970233876683 | 1 |
| 0.9025513819985825 | 1 |
| 0.9029057406094968 | 1 |
| 0.9032600992204111 | 1 |
| 0.9036144578313253 | 1 |
| 0.9039688164422396 | 1 |
| 0.9043231750531537 | 1 |
| 0.904677533664068 | 1 |
| 0.9050318922749823 | 1 |
| 0.9053862508858965 | 1 |
| 0.9057406094968108 | 1 |
| 0.906094968107725 | 1 |
| 0.9064493267186393 | 1 |
| 0.9068036853295535 | 1 |
| 0.9071580439404677 | 1 |
| 0.907512402551382 | 1 |
| 0.9078667611622963 | 1 |
| 0.9082211197732105 | 1 |
| 0.9085754783841248 | 1 |
| 0.9089298369950389 | 1 |
| 0.9092841956059532 | 1 |
| 0.9096385542168675 | 1 |
| 0.9099929128277817 | 1 |
| 0.910347271438696 | 1 |
| 0.9107016300496102 | 1 |
| 0.9110559886605245 | 1 |
| 0.9114103472714387 | 1 |
| 0.9117647058823529 | 1 |
| 0.9121190644932672 | 1 |
| 0.9124734231041814 | 1 |
| 0.9128277817150957 | 1 |
| 0.9131821403260099 | 1 |
| 0.9135364989369241 | 1 |
| 0.9138908575478384 | 1 |
| 0.9142452161587526 | 1 |
| 0.9145995747696669 | 1 |
| 0.9149539333805812 | 1 |
| 0.9153082919914954 | 1 |
| 0.9156626506024097 | 1 |
| 0.9160170092133239 | 1 |
| 0.9163713678242381 | 1 |
| 0.9167257264351524 | 1 |
| 0.9170800850460666 | 1 |
| 0.9174344436569809 | 1 |
| 0.917788802267895 | 1 |
| 0.9181431608788093 | 1 |
| 0.9184975194897236 | 1 |
| 0.9188518781006378 | 1 |
| 0.9192062367115521 | 1 |
| 0.9195605953224664 | 1 |
| 0.9199149539333806 | 1 |
| 0.9202693125442948 | 1 |
| 0.920623671155209 | 1 |
| 0.9209780297661233 | 1 |
| 0.9213323883770376 | 1 |
| 0.9216867469879518 | 1 |
| 0.9220411055988661 | 1 |
| 0.9223954642097802 | 1 |
| 0.9227498228206945 | 1 |
| 0.9231041814316088 | 1 |
| 0.923458540042523 | 1 |
| 0.9238128986534373 | 1 |
| 0.9241672572643516 | 1 |
| 0.9245216158752658 | 1 |
| 0.92487597448618 | 1 |
| 0.9252303330970942 | 1 |
| 0.9255846917080085 | 1 |
| 0.9259390503189228 | 1 |
| 0.926293408929837 | 1 |
| 0.9266477675407513 | 1 |
| 0.9270021261516654 | 1 |
| 0.9273564847625797 | 1 |
| 0.927710843373494 | 1 |
| 0.9280652019844082 | 1 |
| 0.9284195605953225 | 1 |
| 0.9287739192062368 | 1 |
| 0.929128277817151 | 1 |
| 0.9294826364280652 | 1 |
| 0.9298369950389794 | 1 |
| 0.9301913536498937 | 1 |
| 0.930545712260808 | 1 |
| 0.9309000708717222 | 1 |
| 0.9312544294826364 | 1 |
| 0.9316087880935506 | 1 |
| 0.9319631467044649 | 1 |
| 0.9323175053153792 | 1 |
| 0.9326718639262934 | 1 |
| 0.9330262225372077 | 1 |
| 0.933380581148122 | 1 |
| 0.9337349397590361 | 1 |
| 0.9340892983699504 | 1 |
| 0.9344436569808646 | 1 |
| 0.9347980155917789 | 1 |
| 0.9351523742026931 | 1 |
| 0.9355067328136074 | 1 |
| 0.9358610914245216 | 1 |
| 0.9362154500354358 | 1 |
| 0.9365698086463501 | 1 |
| 0.9369241672572644 | 1 |
| 0.9372785258681786 | 1 |
| 0.9376328844790929 | 1 |
| 0.9379872430900071 | 1 |
| 0.9383416017009213 | 1 |
| 0.9386959603118356 | 1 |
| 0.9390503189227498 | 1 |
| 0.9394046775336641 | 1 |
| 0.9397590361445783 | 1 |
| 0.9401133947554926 | 1 |
| 0.9404677533664068 | 1 |
| 0.940822111977321 | 1 |
| 0.9411764705882353 | 1 |
| 0.9415308291991495 | 1 |
| 0.9418851878100638 | 1 |
| 0.9422395464209781 | 1 |
| 0.9425939050318923 | 1 |
| 0.9429482636428065 | 1 |
| 0.9433026222537207 | 1 |
| 0.943656980864635 | 1 |
| 0.9440113394755493 | 1 |
| 0.9443656980864635 | 1 |
| 0.9447200566973778 | 1 |
| 0.945074415308292 | 1 |
| 0.9454287739192062 | 1 |
| 0.9457831325301205 | 1 |
| 0.9461374911410347 | 1 |
| 0.946491849751949 | 1 |
| 0.9468462083628633 | 1 |
| 0.9472005669737774 | 1 |
| 0.9475549255846917 | 1 |
| 0.9479092841956059 | 1 |
| 0.9482636428065202 | 1 |
| 0.9486180014174345 | 1 |
| 0.9489723600283487 | 1 |
| 0.9493267186392629 | 1 |
| 0.9496810772501771 | 1 |
| 0.9500354358610914 | 1 |
| 0.9503897944720057 | 1 |
| 0.9507441530829199 | 1 |
| 0.9510985116938342 | 1 |
| 0.9514528703047485 | 1 |
| 0.9518072289156626 | 1 |
| 0.9521615875265769 | 1 |
| 0.9525159461374911 | 1 |
| 0.9528703047484054 | 1 |
| 0.9532246633593197 | 1 |
| 0.9535790219702339 | 1 |
| 0.9539333805811481 | 1 |
| 0.9542877391920623 | 1 |
| 0.9546420978029766 | 1 |
| 0.9549964564138909 | 1 |
| 0.9553508150248051 | 1 |
| 0.9557051736357194 | 1 |
| 0.9560595322466336 | 1 |
| 0.9564138908575478 | 1 |
| 0.9567682494684621 | 1 |
| 0.9571226080793763 | 1 |
| 0.9574769666902906 | 1 |
| 0.9578313253012049 | 1 |
| 0.9581856839121191 | 1 |
| 0.9585400425230333 | 1 |
| 0.9588944011339475 | 1 |
| 0.9592487597448618 | 1 |
| 0.959603118355776 | 1 |
| 0.9599574769666903 | 1 |
| 0.9603118355776046 | 1 |
| 0.9606661941885187 | 1 |
| 0.961020552799433 | 1 |
| 0.9613749114103473 | 1 |
| 0.9617292700212615 | 1 |
| 0.9620836286321758 | 1 |
| 0.96243798724309 | 1 |
| 0.9627923458540042 | 1 |
| 0.9631467044649185 | 1 |
| 0.9635010630758327 | 1 |
| 0.963855421686747 | 1 |
| 0.9642097802976612 | 1 |
| 0.9645641389085755 | 1 |
| 0.9649184975194898 | 1 |
| 0.9652728561304039 | 1 |
| 0.9656272147413182 | 1 |
| 0.9659815733522324 | 1 |
| 0.9663359319631467 | 1 |
| 0.966690290574061 | 1 |
| 0.9670446491849752 | 1 |
| 0.9673990077958894 | 1 |
| 0.9677533664068037 | 1 |
| 0.9681077250177179 | 1 |
| 0.9684620836286322 | 1 |
| 0.9688164422395464 | 1 |
| 0.9691708008504607 | 1 |
| 0.969525159461375 | 1 |
| 0.9698795180722891 | 1 |
| 0.9702338766832034 | 1 |
| 0.9705882352941176 | 1 |
| 0.9709425939050319 | 1 |
| 0.9712969525159462 | 1 |
| 0.9716513111268604 | 1 |
| 0.9720056697377746 | 1 |
| 0.9723600283486888 | 1 |
| 0.9727143869596031 | 1 |
| 0.9730687455705174 | 1 |
| 0.9734231041814316 | 1 |
| 0.9737774627923459 | 1 |
| 0.9741318214032602 | 1 |
| 0.9744861800141743 | 1 |
| 0.9748405386250886 | 1 |
| 0.9751948972360028 | 1 |
| 0.9755492558469171 | 1 |
| 0.9759036144578314 | 1 |
| 0.9762579730687456 | 1 |
| 0.9766123316796598 | 1 |
| 0.976966690290574 | 1 |
| 0.9773210489014883 | 1 |
| 0.9776754075124026 | 1 |
| 0.9780297661233168 | 1 |
| 0.9783841247342311 | 1 |
| 0.9787384833451452 | 1 |
| 0.9790928419560595 | 1 |
| 0.9794472005669738 | 1 |
| 0.979801559177888 | 1 |
| 0.9801559177888023 | 1 |
| 0.9805102763997166 | 1 |
| 0.9808646350106307 | 1 |
| 0.981218993621545 | 1 |
| 0.9815733522324592 | 1 |
| 0.9819277108433735 | 1 |
| 0.9822820694542878 | 1 |
| 0.982636428065202 | 1 |
| 0.9829907866761163 | 1 |
| 0.9833451452870304 | 1 |
| 0.9836995038979447 | 1 |
| 0.984053862508859 | 1 |
| 0.9844082211197732 | 1 |
| 0.9847625797306875 | 1 |
| 0.9851169383416017 | 1 |
| 0.9854712969525159 | 1 |
| 0.9858256555634302 | 1 |
| 0.9861800141743444 | 1 |
| 0.9865343727852587 | 1 |
| 0.986888731396173 | 1 |
| 0.9872430900070872 | 1 |
| 0.9875974486180015 | 1 |
| 0.9879518072289156 | 1 |
| 0.9883061658398299 | 1 |
| 0.9886605244507441 | 1 |
| 0.9890148830616584 | 1 |
| 0.9893692416725727 | 1 |
| 0.9897236002834869 | 1 |
| 0.9900779588944011 | 1 |
| 0.9904323175053154 | 1 |
| 0.9907866761162296 | 1 |
| 0.9911410347271439 | 1 |
| 0.9914953933380581 | 1 |
| 0.9918497519489724 | 1 |
| 0.9922041105598866 | 1 |
| 0.9925584691708008 | 1 |
| 0.9929128277817151 | 1 |
| 0.9932671863926293 | 1 |
| 0.9936215450035436 | 1 |
| 0.9939759036144579 | 1 |
| 0.9943302622253721 | 1 |
| 0.9946846208362863 | 1 |
| 0.9950389794472005 | 1 |
| 0.9953933380581148 | 1 |
| 0.9957476966690291 | 1 |
| 0.9961020552799433 | 1 |
| 0.9964564138908576 | 1 |
| 0.9968107725017717 | 1 |
| 0.997165131112686 | 1 |
| 0.9975194897236003 | 1 |
| 0.9978738483345145 | 1 |
| 0.9982282069454288 | 1 |
| 0.9985825655563431 | 1 |
| 0.9989369241672572 | 1 |
| 0.9992912827781715 | 1 |